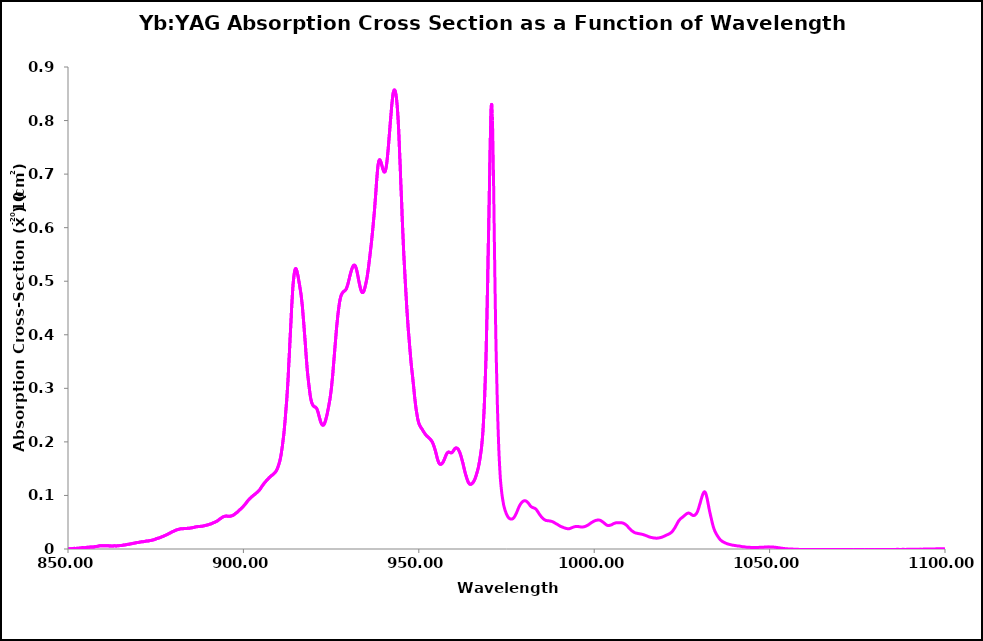
| Category | 250K |
|---|---|
| 850.0 | 0 |
| 850.05 | 0 |
| 850.1 | 0 |
| 850.15 | 0 |
| 850.2 | 0 |
| 850.25 | 0 |
| 850.3 | 0 |
| 850.35 | 0 |
| 850.4 | 0 |
| 850.45 | 0 |
| 850.5 | 0 |
| 850.55 | 0 |
| 850.6 | 0 |
| 850.65 | 0 |
| 850.7 | 0 |
| 850.75 | 0 |
| 850.8 | 0 |
| 850.85 | 0 |
| 850.9 | 0 |
| 850.95 | 0 |
| 851.0 | 0 |
| 851.05 | 0.001 |
| 851.1 | 0.001 |
| 851.15 | 0.001 |
| 851.2 | 0.001 |
| 851.25 | 0.001 |
| 851.3 | 0.001 |
| 851.35 | 0.001 |
| 851.4 | 0.001 |
| 851.45 | 0.001 |
| 851.5 | 0.001 |
| 851.55 | 0.001 |
| 851.6 | 0.001 |
| 851.65 | 0.001 |
| 851.7 | 0.001 |
| 851.75 | 0.001 |
| 851.8 | 0.001 |
| 851.85 | 0.001 |
| 851.9 | 0.001 |
| 851.95 | 0.001 |
| 852.0 | 0.001 |
| 852.05 | 0.001 |
| 852.1 | 0.001 |
| 852.15 | 0.001 |
| 852.2 | 0.001 |
| 852.25 | 0.001 |
| 852.3 | 0.001 |
| 852.35 | 0.001 |
| 852.4 | 0.001 |
| 852.45 | 0.001 |
| 852.5 | 0.001 |
| 852.55 | 0.001 |
| 852.6 | 0.001 |
| 852.65 | 0.002 |
| 852.7 | 0.001 |
| 852.75 | 0.001 |
| 852.8 | 0.001 |
| 852.85 | 0.001 |
| 852.9 | 0.001 |
| 852.95 | 0.002 |
| 853.0 | 0.001 |
| 853.05 | 0.001 |
| 853.1 | 0.001 |
| 853.15 | 0.002 |
| 853.2 | 0.001 |
| 853.25 | 0.002 |
| 853.3 | 0.002 |
| 853.35 | 0.002 |
| 853.4 | 0.002 |
| 853.45 | 0.002 |
| 853.5 | 0.002 |
| 853.55 | 0.002 |
| 853.6 | 0.002 |
| 853.65 | 0.002 |
| 853.7 | 0.002 |
| 853.75 | 0.002 |
| 853.8 | 0.002 |
| 853.85 | 0.002 |
| 853.9 | 0.002 |
| 853.95 | 0.002 |
| 854.0 | 0.002 |
| 854.05 | 0.002 |
| 854.1 | 0.003 |
| 854.15 | 0.003 |
| 854.2 | 0.003 |
| 854.25 | 0.003 |
| 854.3 | 0.003 |
| 854.35 | 0.003 |
| 854.4 | 0.002 |
| 854.45 | 0.002 |
| 854.5 | 0.002 |
| 854.55 | 0.002 |
| 854.6 | 0.002 |
| 854.65 | 0.002 |
| 854.7 | 0.002 |
| 854.75 | 0.002 |
| 854.8 | 0.002 |
| 854.85 | 0.002 |
| 854.9 | 0.003 |
| 854.95 | 0.003 |
| 855.0 | 0.003 |
| 855.05 | 0.003 |
| 855.1 | 0.003 |
| 855.15 | 0.003 |
| 855.2 | 0.003 |
| 855.25 | 0.003 |
| 855.3 | 0.003 |
| 855.35 | 0.003 |
| 855.4 | 0.003 |
| 855.45 | 0.003 |
| 855.5 | 0.003 |
| 855.55 | 0.003 |
| 855.6 | 0.003 |
| 855.65 | 0.003 |
| 855.7 | 0.003 |
| 855.75 | 0.003 |
| 855.8 | 0.003 |
| 855.85 | 0.003 |
| 855.9 | 0.003 |
| 855.95 | 0.003 |
| 856.0 | 0.003 |
| 856.05 | 0.003 |
| 856.1 | 0.003 |
| 856.15 | 0.003 |
| 856.2 | 0.004 |
| 856.25 | 0.003 |
| 856.3 | 0.004 |
| 856.35 | 0.004 |
| 856.4 | 0.004 |
| 856.45 | 0.004 |
| 856.5 | 0.004 |
| 856.55 | 0.004 |
| 856.6 | 0.004 |
| 856.65 | 0.004 |
| 856.7 | 0.004 |
| 856.75 | 0.004 |
| 856.8 | 0.004 |
| 856.85 | 0.004 |
| 856.9 | 0.004 |
| 856.95 | 0.004 |
| 857.0 | 0.004 |
| 857.05 | 0.004 |
| 857.1 | 0.004 |
| 857.15 | 0.004 |
| 857.2 | 0.004 |
| 857.25 | 0.004 |
| 857.3 | 0.004 |
| 857.35 | 0.004 |
| 857.4 | 0.004 |
| 857.45 | 0.004 |
| 857.5 | 0.004 |
| 857.55 | 0.004 |
| 857.6 | 0.004 |
| 857.65 | 0.004 |
| 857.7 | 0.004 |
| 857.75 | 0.004 |
| 857.8 | 0.005 |
| 857.85 | 0.005 |
| 857.9 | 0.005 |
| 857.95 | 0.005 |
| 858.0 | 0.005 |
| 858.05 | 0.005 |
| 858.1 | 0.005 |
| 858.15 | 0.005 |
| 858.2 | 0.005 |
| 858.25 | 0.005 |
| 858.3 | 0.005 |
| 858.35 | 0.005 |
| 858.4 | 0.005 |
| 858.45 | 0.005 |
| 858.5 | 0.005 |
| 858.55 | 0.005 |
| 858.6 | 0.005 |
| 858.65 | 0.005 |
| 858.7 | 0.005 |
| 858.75 | 0.006 |
| 858.8 | 0.006 |
| 858.85 | 0.006 |
| 858.9 | 0.006 |
| 858.95 | 0.006 |
| 859.0 | 0.006 |
| 859.05 | 0.006 |
| 859.1 | 0.006 |
| 859.15 | 0.006 |
| 859.2 | 0.006 |
| 859.25 | 0.006 |
| 859.3 | 0.006 |
| 859.35 | 0.006 |
| 859.4 | 0.006 |
| 859.45 | 0.006 |
| 859.5 | 0.006 |
| 859.55 | 0.006 |
| 859.6 | 0.006 |
| 859.65 | 0.006 |
| 859.7 | 0.006 |
| 859.75 | 0.006 |
| 859.8 | 0.006 |
| 859.85 | 0.006 |
| 859.9 | 0.006 |
| 859.95 | 0.006 |
| 860.0 | 0.006 |
| 860.05 | 0.006 |
| 860.1 | 0.006 |
| 860.15 | 0.006 |
| 860.2 | 0.006 |
| 860.25 | 0.006 |
| 860.3 | 0.006 |
| 860.35 | 0.006 |
| 860.4 | 0.006 |
| 860.45 | 0.006 |
| 860.5 | 0.006 |
| 860.55 | 0.006 |
| 860.6 | 0.006 |
| 860.65 | 0.006 |
| 860.7 | 0.006 |
| 860.75 | 0.006 |
| 860.8 | 0.006 |
| 860.85 | 0.006 |
| 860.9 | 0.006 |
| 860.95 | 0.006 |
| 861.0 | 0.006 |
| 861.05 | 0.006 |
| 861.1 | 0.006 |
| 861.15 | 0.006 |
| 861.2 | 0.006 |
| 861.25 | 0.006 |
| 861.3 | 0.006 |
| 861.35 | 0.006 |
| 861.4 | 0.006 |
| 861.45 | 0.006 |
| 861.5 | 0.006 |
| 861.55 | 0.006 |
| 861.6 | 0.006 |
| 861.65 | 0.006 |
| 861.7 | 0.006 |
| 861.75 | 0.006 |
| 861.8 | 0.006 |
| 861.85 | 0.006 |
| 861.9 | 0.006 |
| 861.95 | 0.006 |
| 862.0 | 0.006 |
| 862.05 | 0.006 |
| 862.1 | 0.006 |
| 862.15 | 0.006 |
| 862.2 | 0.006 |
| 862.25 | 0.006 |
| 862.3 | 0.006 |
| 862.35 | 0.006 |
| 862.4 | 0.006 |
| 862.45 | 0.006 |
| 862.5 | 0.006 |
| 862.55 | 0.006 |
| 862.6 | 0.006 |
| 862.65 | 0.006 |
| 862.7 | 0.006 |
| 862.75 | 0.006 |
| 862.8 | 0.006 |
| 862.85 | 0.006 |
| 862.9 | 0.006 |
| 862.95 | 0.006 |
| 863.0 | 0.006 |
| 863.05 | 0.006 |
| 863.1 | 0.006 |
| 863.15 | 0.006 |
| 863.2 | 0.006 |
| 863.25 | 0.006 |
| 863.3 | 0.006 |
| 863.35 | 0.006 |
| 863.4 | 0.006 |
| 863.45 | 0.006 |
| 863.5 | 0.006 |
| 863.55 | 0.006 |
| 863.6 | 0.006 |
| 863.65 | 0.006 |
| 863.7 | 0.006 |
| 863.75 | 0.006 |
| 863.8 | 0.006 |
| 863.85 | 0.006 |
| 863.9 | 0.006 |
| 863.95 | 0.006 |
| 864.0 | 0.006 |
| 864.05 | 0.006 |
| 864.1 | 0.006 |
| 864.15 | 0.006 |
| 864.2 | 0.006 |
| 864.25 | 0.006 |
| 864.3 | 0.006 |
| 864.35 | 0.006 |
| 864.4 | 0.006 |
| 864.45 | 0.006 |
| 864.5 | 0.006 |
| 864.55 | 0.006 |
| 864.6 | 0.006 |
| 864.65 | 0.006 |
| 864.7 | 0.006 |
| 864.75 | 0.006 |
| 864.8 | 0.006 |
| 864.85 | 0.007 |
| 864.9 | 0.007 |
| 864.95 | 0.007 |
| 865.0 | 0.007 |
| 865.05 | 0.007 |
| 865.1 | 0.007 |
| 865.15 | 0.007 |
| 865.2 | 0.007 |
| 865.25 | 0.007 |
| 865.3 | 0.007 |
| 865.35 | 0.007 |
| 865.4 | 0.007 |
| 865.45 | 0.007 |
| 865.5 | 0.007 |
| 865.55 | 0.007 |
| 865.6 | 0.007 |
| 865.65 | 0.007 |
| 865.7 | 0.007 |
| 865.75 | 0.007 |
| 865.8 | 0.007 |
| 865.85 | 0.007 |
| 865.9 | 0.007 |
| 865.95 | 0.007 |
| 866.0 | 0.007 |
| 866.05 | 0.007 |
| 866.1 | 0.008 |
| 866.15 | 0.008 |
| 866.2 | 0.008 |
| 866.25 | 0.008 |
| 866.3 | 0.008 |
| 866.35 | 0.008 |
| 866.4 | 0.008 |
| 866.45 | 0.008 |
| 866.5 | 0.008 |
| 866.55 | 0.008 |
| 866.6 | 0.008 |
| 866.65 | 0.008 |
| 866.7 | 0.008 |
| 866.75 | 0.008 |
| 866.8 | 0.008 |
| 866.85 | 0.008 |
| 866.9 | 0.009 |
| 866.95 | 0.009 |
| 867.0 | 0.009 |
| 867.05 | 0.009 |
| 867.1 | 0.009 |
| 867.15 | 0.009 |
| 867.2 | 0.009 |
| 867.25 | 0.009 |
| 867.3 | 0.009 |
| 867.35 | 0.009 |
| 867.4 | 0.009 |
| 867.45 | 0.009 |
| 867.5 | 0.009 |
| 867.55 | 0.009 |
| 867.6 | 0.009 |
| 867.65 | 0.009 |
| 867.7 | 0.009 |
| 867.75 | 0.009 |
| 867.8 | 0.009 |
| 867.85 | 0.01 |
| 867.9 | 0.01 |
| 867.95 | 0.01 |
| 868.0 | 0.01 |
| 868.05 | 0.01 |
| 868.1 | 0.01 |
| 868.15 | 0.01 |
| 868.2 | 0.01 |
| 868.25 | 0.01 |
| 868.3 | 0.01 |
| 868.35 | 0.01 |
| 868.4 | 0.01 |
| 868.45 | 0.01 |
| 868.5 | 0.01 |
| 868.55 | 0.011 |
| 868.6 | 0.011 |
| 868.65 | 0.011 |
| 868.7 | 0.011 |
| 868.75 | 0.011 |
| 868.8 | 0.011 |
| 868.85 | 0.011 |
| 868.9 | 0.011 |
| 868.95 | 0.011 |
| 869.0 | 0.011 |
| 869.05 | 0.011 |
| 869.1 | 0.011 |
| 869.15 | 0.011 |
| 869.2 | 0.011 |
| 869.25 | 0.011 |
| 869.3 | 0.012 |
| 869.35 | 0.012 |
| 869.4 | 0.012 |
| 869.45 | 0.012 |
| 869.5 | 0.012 |
| 869.55 | 0.012 |
| 869.6 | 0.012 |
| 869.65 | 0.012 |
| 869.7 | 0.012 |
| 869.75 | 0.012 |
| 869.8 | 0.012 |
| 869.85 | 0.012 |
| 869.9 | 0.012 |
| 869.95 | 0.012 |
| 870.0 | 0.012 |
| 870.05 | 0.012 |
| 870.1 | 0.012 |
| 870.15 | 0.012 |
| 870.2 | 0.012 |
| 870.25 | 0.013 |
| 870.3 | 0.013 |
| 870.35 | 0.013 |
| 870.4 | 0.013 |
| 870.45 | 0.013 |
| 870.5 | 0.013 |
| 870.55 | 0.013 |
| 870.6 | 0.013 |
| 870.65 | 0.013 |
| 870.7 | 0.013 |
| 870.75 | 0.013 |
| 870.8 | 0.013 |
| 870.85 | 0.013 |
| 870.9 | 0.013 |
| 870.95 | 0.013 |
| 871.0 | 0.013 |
| 871.05 | 0.014 |
| 871.1 | 0.014 |
| 871.15 | 0.014 |
| 871.2 | 0.014 |
| 871.25 | 0.014 |
| 871.3 | 0.014 |
| 871.35 | 0.014 |
| 871.4 | 0.014 |
| 871.45 | 0.014 |
| 871.5 | 0.014 |
| 871.55 | 0.014 |
| 871.6 | 0.014 |
| 871.65 | 0.014 |
| 871.7 | 0.014 |
| 871.75 | 0.014 |
| 871.8 | 0.014 |
| 871.85 | 0.014 |
| 871.9 | 0.014 |
| 871.95 | 0.014 |
| 872.0 | 0.014 |
| 872.05 | 0.014 |
| 872.1 | 0.014 |
| 872.15 | 0.015 |
| 872.2 | 0.015 |
| 872.25 | 0.015 |
| 872.3 | 0.015 |
| 872.35 | 0.015 |
| 872.4 | 0.015 |
| 872.45 | 0.015 |
| 872.5 | 0.015 |
| 872.55 | 0.015 |
| 872.6 | 0.015 |
| 872.65 | 0.015 |
| 872.7 | 0.015 |
| 872.75 | 0.015 |
| 872.8 | 0.015 |
| 872.85 | 0.015 |
| 872.9 | 0.015 |
| 872.95 | 0.015 |
| 873.0 | 0.015 |
| 873.05 | 0.015 |
| 873.1 | 0.015 |
| 873.15 | 0.015 |
| 873.2 | 0.015 |
| 873.25 | 0.016 |
| 873.3 | 0.016 |
| 873.35 | 0.016 |
| 873.4 | 0.016 |
| 873.45 | 0.016 |
| 873.5 | 0.016 |
| 873.55 | 0.016 |
| 873.6 | 0.016 |
| 873.65 | 0.016 |
| 873.7 | 0.016 |
| 873.75 | 0.016 |
| 873.8 | 0.016 |
| 873.85 | 0.016 |
| 873.9 | 0.016 |
| 873.95 | 0.016 |
| 874.0 | 0.017 |
| 874.05 | 0.017 |
| 874.1 | 0.017 |
| 874.15 | 0.017 |
| 874.2 | 0.017 |
| 874.25 | 0.017 |
| 874.3 | 0.017 |
| 874.35 | 0.017 |
| 874.4 | 0.017 |
| 874.45 | 0.017 |
| 874.5 | 0.017 |
| 874.55 | 0.017 |
| 874.6 | 0.018 |
| 874.65 | 0.018 |
| 874.7 | 0.018 |
| 874.75 | 0.018 |
| 874.8 | 0.018 |
| 874.85 | 0.018 |
| 874.9 | 0.018 |
| 874.95 | 0.018 |
| 875.0 | 0.019 |
| 875.05 | 0.019 |
| 875.1 | 0.019 |
| 875.15 | 0.019 |
| 875.2 | 0.019 |
| 875.25 | 0.019 |
| 875.3 | 0.019 |
| 875.35 | 0.019 |
| 875.4 | 0.02 |
| 875.45 | 0.02 |
| 875.5 | 0.02 |
| 875.55 | 0.02 |
| 875.6 | 0.02 |
| 875.65 | 0.02 |
| 875.7 | 0.02 |
| 875.75 | 0.02 |
| 875.8 | 0.02 |
| 875.85 | 0.02 |
| 875.9 | 0.021 |
| 875.95 | 0.021 |
| 876.0 | 0.021 |
| 876.05 | 0.021 |
| 876.1 | 0.021 |
| 876.15 | 0.021 |
| 876.2 | 0.021 |
| 876.25 | 0.021 |
| 876.3 | 0.021 |
| 876.35 | 0.022 |
| 876.4 | 0.022 |
| 876.45 | 0.022 |
| 876.5 | 0.022 |
| 876.55 | 0.022 |
| 876.6 | 0.022 |
| 876.65 | 0.023 |
| 876.7 | 0.023 |
| 876.75 | 0.023 |
| 876.8 | 0.023 |
| 876.85 | 0.023 |
| 876.9 | 0.023 |
| 876.95 | 0.023 |
| 877.0 | 0.023 |
| 877.05 | 0.023 |
| 877.1 | 0.023 |
| 877.15 | 0.024 |
| 877.2 | 0.024 |
| 877.25 | 0.024 |
| 877.3 | 0.024 |
| 877.35 | 0.024 |
| 877.4 | 0.024 |
| 877.45 | 0.025 |
| 877.5 | 0.025 |
| 877.55 | 0.025 |
| 877.6 | 0.025 |
| 877.65 | 0.025 |
| 877.7 | 0.025 |
| 877.75 | 0.026 |
| 877.8 | 0.026 |
| 877.85 | 0.026 |
| 877.9 | 0.026 |
| 877.95 | 0.026 |
| 878.0 | 0.026 |
| 878.05 | 0.026 |
| 878.1 | 0.027 |
| 878.15 | 0.027 |
| 878.2 | 0.027 |
| 878.25 | 0.027 |
| 878.3 | 0.027 |
| 878.35 | 0.027 |
| 878.4 | 0.028 |
| 878.45 | 0.028 |
| 878.5 | 0.028 |
| 878.55 | 0.028 |
| 878.6 | 0.028 |
| 878.65 | 0.028 |
| 878.7 | 0.029 |
| 878.75 | 0.029 |
| 878.8 | 0.029 |
| 878.85 | 0.029 |
| 878.9 | 0.029 |
| 878.95 | 0.029 |
| 879.0 | 0.03 |
| 879.05 | 0.03 |
| 879.1 | 0.03 |
| 879.15 | 0.03 |
| 879.2 | 0.03 |
| 879.25 | 0.03 |
| 879.3 | 0.031 |
| 879.35 | 0.031 |
| 879.4 | 0.031 |
| 879.45 | 0.031 |
| 879.5 | 0.031 |
| 879.55 | 0.032 |
| 879.6 | 0.032 |
| 879.65 | 0.032 |
| 879.7 | 0.032 |
| 879.75 | 0.032 |
| 879.8 | 0.032 |
| 879.85 | 0.033 |
| 879.9 | 0.033 |
| 879.95 | 0.033 |
| 880.0 | 0.033 |
| 880.05 | 0.033 |
| 880.1 | 0.033 |
| 880.15 | 0.033 |
| 880.2 | 0.033 |
| 880.25 | 0.034 |
| 880.3 | 0.034 |
| 880.35 | 0.034 |
| 880.4 | 0.034 |
| 880.45 | 0.034 |
| 880.5 | 0.034 |
| 880.55 | 0.035 |
| 880.6 | 0.035 |
| 880.65 | 0.035 |
| 880.7 | 0.035 |
| 880.75 | 0.035 |
| 880.8 | 0.035 |
| 880.85 | 0.035 |
| 880.9 | 0.036 |
| 880.95 | 0.036 |
| 881.0 | 0.036 |
| 881.05 | 0.036 |
| 881.1 | 0.036 |
| 881.15 | 0.036 |
| 881.2 | 0.036 |
| 881.25 | 0.036 |
| 881.3 | 0.036 |
| 881.35 | 0.036 |
| 881.4 | 0.037 |
| 881.45 | 0.037 |
| 881.5 | 0.037 |
| 881.55 | 0.037 |
| 881.6 | 0.037 |
| 881.65 | 0.037 |
| 881.7 | 0.037 |
| 881.75 | 0.037 |
| 881.8 | 0.037 |
| 881.85 | 0.037 |
| 881.9 | 0.037 |
| 881.95 | 0.037 |
| 882.0 | 0.038 |
| 882.05 | 0.038 |
| 882.1 | 0.038 |
| 882.15 | 0.038 |
| 882.2 | 0.038 |
| 882.25 | 0.038 |
| 882.3 | 0.038 |
| 882.35 | 0.038 |
| 882.4 | 0.038 |
| 882.45 | 0.038 |
| 882.5 | 0.038 |
| 882.55 | 0.038 |
| 882.6 | 0.038 |
| 882.65 | 0.038 |
| 882.7 | 0.038 |
| 882.75 | 0.038 |
| 882.8 | 0.038 |
| 882.85 | 0.038 |
| 882.9 | 0.038 |
| 882.95 | 0.038 |
| 883.0 | 0.038 |
| 883.05 | 0.038 |
| 883.1 | 0.038 |
| 883.15 | 0.038 |
| 883.2 | 0.038 |
| 883.25 | 0.038 |
| 883.3 | 0.038 |
| 883.35 | 0.038 |
| 883.4 | 0.038 |
| 883.45 | 0.038 |
| 883.5 | 0.038 |
| 883.55 | 0.038 |
| 883.6 | 0.038 |
| 883.65 | 0.038 |
| 883.7 | 0.038 |
| 883.75 | 0.038 |
| 883.8 | 0.038 |
| 883.85 | 0.038 |
| 883.9 | 0.039 |
| 883.95 | 0.039 |
| 884.0 | 0.039 |
| 884.05 | 0.039 |
| 884.1 | 0.039 |
| 884.15 | 0.039 |
| 884.2 | 0.039 |
| 884.25 | 0.039 |
| 884.3 | 0.039 |
| 884.35 | 0.039 |
| 884.4 | 0.039 |
| 884.45 | 0.039 |
| 884.5 | 0.039 |
| 884.55 | 0.039 |
| 884.6 | 0.039 |
| 884.65 | 0.039 |
| 884.7 | 0.039 |
| 884.75 | 0.039 |
| 884.8 | 0.039 |
| 884.85 | 0.039 |
| 884.9 | 0.039 |
| 884.95 | 0.039 |
| 885.0 | 0.039 |
| 885.05 | 0.039 |
| 885.1 | 0.039 |
| 885.15 | 0.039 |
| 885.2 | 0.039 |
| 885.25 | 0.039 |
| 885.3 | 0.04 |
| 885.35 | 0.04 |
| 885.4 | 0.04 |
| 885.45 | 0.04 |
| 885.5 | 0.04 |
| 885.55 | 0.04 |
| 885.6 | 0.04 |
| 885.65 | 0.04 |
| 885.7 | 0.04 |
| 885.75 | 0.04 |
| 885.8 | 0.04 |
| 885.85 | 0.04 |
| 885.9 | 0.04 |
| 885.95 | 0.041 |
| 886.0 | 0.041 |
| 886.05 | 0.041 |
| 886.1 | 0.041 |
| 886.15 | 0.041 |
| 886.2 | 0.041 |
| 886.25 | 0.041 |
| 886.3 | 0.041 |
| 886.35 | 0.041 |
| 886.4 | 0.041 |
| 886.45 | 0.041 |
| 886.5 | 0.041 |
| 886.55 | 0.041 |
| 886.6 | 0.041 |
| 886.65 | 0.042 |
| 886.7 | 0.042 |
| 886.75 | 0.042 |
| 886.8 | 0.042 |
| 886.85 | 0.042 |
| 886.9 | 0.042 |
| 886.95 | 0.042 |
| 887.0 | 0.042 |
| 887.05 | 0.042 |
| 887.1 | 0.042 |
| 887.15 | 0.042 |
| 887.2 | 0.042 |
| 887.25 | 0.042 |
| 887.3 | 0.042 |
| 887.35 | 0.042 |
| 887.4 | 0.042 |
| 887.45 | 0.042 |
| 887.5 | 0.042 |
| 887.55 | 0.042 |
| 887.6 | 0.042 |
| 887.65 | 0.042 |
| 887.7 | 0.042 |
| 887.75 | 0.042 |
| 887.8 | 0.042 |
| 887.85 | 0.042 |
| 887.9 | 0.042 |
| 887.95 | 0.042 |
| 888.0 | 0.042 |
| 888.05 | 0.042 |
| 888.1 | 0.042 |
| 888.15 | 0.043 |
| 888.2 | 0.043 |
| 888.25 | 0.043 |
| 888.3 | 0.043 |
| 888.35 | 0.043 |
| 888.4 | 0.043 |
| 888.45 | 0.043 |
| 888.5 | 0.043 |
| 888.55 | 0.043 |
| 888.6 | 0.043 |
| 888.65 | 0.043 |
| 888.7 | 0.043 |
| 888.75 | 0.043 |
| 888.8 | 0.043 |
| 888.85 | 0.043 |
| 888.9 | 0.043 |
| 888.95 | 0.044 |
| 889.0 | 0.044 |
| 889.05 | 0.044 |
| 889.1 | 0.044 |
| 889.15 | 0.044 |
| 889.2 | 0.044 |
| 889.25 | 0.044 |
| 889.3 | 0.044 |
| 889.35 | 0.044 |
| 889.4 | 0.044 |
| 889.45 | 0.044 |
| 889.5 | 0.045 |
| 889.55 | 0.045 |
| 889.6 | 0.045 |
| 889.65 | 0.045 |
| 889.7 | 0.045 |
| 889.75 | 0.045 |
| 889.8 | 0.045 |
| 889.85 | 0.045 |
| 889.9 | 0.045 |
| 889.95 | 0.045 |
| 890.0 | 0.045 |
| 890.05 | 0.045 |
| 890.1 | 0.046 |
| 890.15 | 0.046 |
| 890.2 | 0.046 |
| 890.25 | 0.046 |
| 890.3 | 0.046 |
| 890.35 | 0.046 |
| 890.4 | 0.046 |
| 890.45 | 0.046 |
| 890.5 | 0.047 |
| 890.55 | 0.047 |
| 890.6 | 0.047 |
| 890.65 | 0.047 |
| 890.7 | 0.047 |
| 890.75 | 0.047 |
| 890.8 | 0.047 |
| 890.85 | 0.047 |
| 890.9 | 0.047 |
| 890.95 | 0.047 |
| 891.0 | 0.048 |
| 891.05 | 0.048 |
| 891.1 | 0.048 |
| 891.15 | 0.048 |
| 891.2 | 0.048 |
| 891.25 | 0.048 |
| 891.3 | 0.049 |
| 891.35 | 0.049 |
| 891.4 | 0.049 |
| 891.45 | 0.049 |
| 891.5 | 0.049 |
| 891.55 | 0.049 |
| 891.6 | 0.049 |
| 891.65 | 0.049 |
| 891.7 | 0.05 |
| 891.75 | 0.05 |
| 891.8 | 0.05 |
| 891.85 | 0.05 |
| 891.9 | 0.05 |
| 891.95 | 0.05 |
| 892.0 | 0.05 |
| 892.05 | 0.051 |
| 892.1 | 0.051 |
| 892.15 | 0.051 |
| 892.2 | 0.051 |
| 892.25 | 0.051 |
| 892.3 | 0.052 |
| 892.35 | 0.052 |
| 892.4 | 0.052 |
| 892.45 | 0.052 |
| 892.5 | 0.052 |
| 892.55 | 0.052 |
| 892.6 | 0.053 |
| 892.65 | 0.053 |
| 892.7 | 0.053 |
| 892.75 | 0.053 |
| 892.8 | 0.053 |
| 892.85 | 0.054 |
| 892.9 | 0.054 |
| 892.95 | 0.054 |
| 893.0 | 0.054 |
| 893.05 | 0.055 |
| 893.1 | 0.055 |
| 893.15 | 0.055 |
| 893.2 | 0.056 |
| 893.25 | 0.056 |
| 893.3 | 0.056 |
| 893.35 | 0.056 |
| 893.4 | 0.057 |
| 893.45 | 0.057 |
| 893.5 | 0.057 |
| 893.55 | 0.057 |
| 893.6 | 0.057 |
| 893.65 | 0.058 |
| 893.7 | 0.058 |
| 893.75 | 0.058 |
| 893.8 | 0.058 |
| 893.85 | 0.059 |
| 893.9 | 0.059 |
| 893.95 | 0.059 |
| 894.0 | 0.059 |
| 894.05 | 0.059 |
| 894.1 | 0.06 |
| 894.15 | 0.06 |
| 894.2 | 0.06 |
| 894.25 | 0.06 |
| 894.3 | 0.06 |
| 894.35 | 0.06 |
| 894.4 | 0.06 |
| 894.45 | 0.061 |
| 894.5 | 0.061 |
| 894.55 | 0.061 |
| 894.6 | 0.061 |
| 894.65 | 0.061 |
| 894.7 | 0.061 |
| 894.75 | 0.061 |
| 894.8 | 0.061 |
| 894.85 | 0.061 |
| 894.9 | 0.061 |
| 894.95 | 0.061 |
| 895.0 | 0.061 |
| 895.05 | 0.061 |
| 895.1 | 0.061 |
| 895.15 | 0.061 |
| 895.2 | 0.061 |
| 895.25 | 0.061 |
| 895.3 | 0.061 |
| 895.35 | 0.061 |
| 895.4 | 0.061 |
| 895.45 | 0.061 |
| 895.5 | 0.061 |
| 895.55 | 0.061 |
| 895.6 | 0.061 |
| 895.65 | 0.061 |
| 895.7 | 0.061 |
| 895.75 | 0.061 |
| 895.8 | 0.061 |
| 895.85 | 0.061 |
| 895.9 | 0.061 |
| 895.95 | 0.061 |
| 896.0 | 0.061 |
| 896.05 | 0.061 |
| 896.1 | 0.061 |
| 896.15 | 0.061 |
| 896.2 | 0.061 |
| 896.25 | 0.061 |
| 896.3 | 0.061 |
| 896.35 | 0.061 |
| 896.4 | 0.062 |
| 896.45 | 0.062 |
| 896.5 | 0.062 |
| 896.55 | 0.062 |
| 896.6 | 0.062 |
| 896.65 | 0.062 |
| 896.7 | 0.062 |
| 896.75 | 0.062 |
| 896.8 | 0.062 |
| 896.85 | 0.062 |
| 896.9 | 0.063 |
| 896.95 | 0.063 |
| 897.0 | 0.063 |
| 897.05 | 0.063 |
| 897.1 | 0.063 |
| 897.15 | 0.063 |
| 897.2 | 0.064 |
| 897.25 | 0.064 |
| 897.3 | 0.064 |
| 897.35 | 0.064 |
| 897.4 | 0.064 |
| 897.45 | 0.065 |
| 897.5 | 0.065 |
| 897.55 | 0.065 |
| 897.6 | 0.065 |
| 897.65 | 0.066 |
| 897.7 | 0.066 |
| 897.75 | 0.066 |
| 897.8 | 0.066 |
| 897.85 | 0.067 |
| 897.9 | 0.067 |
| 897.95 | 0.067 |
| 898.0 | 0.068 |
| 898.05 | 0.068 |
| 898.1 | 0.068 |
| 898.15 | 0.068 |
| 898.2 | 0.068 |
| 898.25 | 0.069 |
| 898.3 | 0.069 |
| 898.35 | 0.069 |
| 898.4 | 0.07 |
| 898.45 | 0.07 |
| 898.5 | 0.07 |
| 898.55 | 0.07 |
| 898.6 | 0.071 |
| 898.65 | 0.071 |
| 898.7 | 0.071 |
| 898.75 | 0.072 |
| 898.8 | 0.072 |
| 898.85 | 0.072 |
| 898.9 | 0.073 |
| 898.95 | 0.073 |
| 899.0 | 0.073 |
| 899.05 | 0.074 |
| 899.1 | 0.074 |
| 899.15 | 0.074 |
| 899.2 | 0.075 |
| 899.25 | 0.075 |
| 899.3 | 0.075 |
| 899.35 | 0.076 |
| 899.4 | 0.076 |
| 899.45 | 0.076 |
| 899.5 | 0.076 |
| 899.55 | 0.077 |
| 899.6 | 0.077 |
| 899.65 | 0.077 |
| 899.7 | 0.078 |
| 899.75 | 0.078 |
| 899.8 | 0.078 |
| 899.85 | 0.079 |
| 899.9 | 0.079 |
| 899.95 | 0.079 |
| 900.0 | 0.08 |
| 900.05 | 0.08 |
| 900.1 | 0.08 |
| 900.15 | 0.081 |
| 900.2 | 0.081 |
| 900.25 | 0.082 |
| 900.3 | 0.082 |
| 900.35 | 0.082 |
| 900.4 | 0.083 |
| 900.45 | 0.083 |
| 900.5 | 0.084 |
| 900.55 | 0.084 |
| 900.6 | 0.084 |
| 900.65 | 0.085 |
| 900.7 | 0.085 |
| 900.75 | 0.086 |
| 900.8 | 0.086 |
| 900.85 | 0.087 |
| 900.9 | 0.087 |
| 900.95 | 0.087 |
| 901.0 | 0.088 |
| 901.05 | 0.088 |
| 901.1 | 0.089 |
| 901.15 | 0.089 |
| 901.2 | 0.09 |
| 901.25 | 0.09 |
| 901.3 | 0.09 |
| 901.35 | 0.091 |
| 901.4 | 0.091 |
| 901.45 | 0.092 |
| 901.5 | 0.092 |
| 901.55 | 0.092 |
| 901.6 | 0.093 |
| 901.65 | 0.093 |
| 901.7 | 0.093 |
| 901.75 | 0.094 |
| 901.8 | 0.094 |
| 901.85 | 0.094 |
| 901.9 | 0.095 |
| 901.95 | 0.095 |
| 902.0 | 0.095 |
| 902.05 | 0.096 |
| 902.1 | 0.096 |
| 902.15 | 0.096 |
| 902.2 | 0.096 |
| 902.25 | 0.097 |
| 902.3 | 0.097 |
| 902.35 | 0.097 |
| 902.4 | 0.098 |
| 902.45 | 0.098 |
| 902.5 | 0.098 |
| 902.55 | 0.098 |
| 902.6 | 0.099 |
| 902.65 | 0.099 |
| 902.7 | 0.099 |
| 902.75 | 0.1 |
| 902.8 | 0.1 |
| 902.85 | 0.1 |
| 902.9 | 0.1 |
| 902.95 | 0.101 |
| 903.0 | 0.101 |
| 903.05 | 0.101 |
| 903.1 | 0.101 |
| 903.15 | 0.102 |
| 903.2 | 0.102 |
| 903.25 | 0.102 |
| 903.3 | 0.102 |
| 903.35 | 0.103 |
| 903.4 | 0.103 |
| 903.45 | 0.103 |
| 903.5 | 0.103 |
| 903.55 | 0.104 |
| 903.6 | 0.104 |
| 903.65 | 0.104 |
| 903.7 | 0.105 |
| 903.75 | 0.105 |
| 903.8 | 0.105 |
| 903.85 | 0.105 |
| 903.9 | 0.106 |
| 903.95 | 0.106 |
| 904.0 | 0.106 |
| 904.05 | 0.107 |
| 904.1 | 0.107 |
| 904.15 | 0.107 |
| 904.2 | 0.107 |
| 904.25 | 0.108 |
| 904.3 | 0.108 |
| 904.35 | 0.109 |
| 904.4 | 0.109 |
| 904.45 | 0.109 |
| 904.5 | 0.11 |
| 904.55 | 0.11 |
| 904.6 | 0.11 |
| 904.65 | 0.111 |
| 904.7 | 0.111 |
| 904.75 | 0.112 |
| 904.8 | 0.112 |
| 904.85 | 0.113 |
| 904.9 | 0.113 |
| 904.95 | 0.114 |
| 905.0 | 0.114 |
| 905.05 | 0.115 |
| 905.1 | 0.115 |
| 905.15 | 0.116 |
| 905.2 | 0.116 |
| 905.25 | 0.117 |
| 905.3 | 0.117 |
| 905.35 | 0.118 |
| 905.4 | 0.118 |
| 905.45 | 0.118 |
| 905.5 | 0.119 |
| 905.55 | 0.119 |
| 905.6 | 0.12 |
| 905.65 | 0.12 |
| 905.7 | 0.121 |
| 905.75 | 0.121 |
| 905.8 | 0.122 |
| 905.85 | 0.122 |
| 905.9 | 0.122 |
| 905.95 | 0.123 |
| 906.0 | 0.123 |
| 906.05 | 0.124 |
| 906.1 | 0.124 |
| 906.15 | 0.125 |
| 906.2 | 0.125 |
| 906.25 | 0.125 |
| 906.3 | 0.126 |
| 906.35 | 0.126 |
| 906.4 | 0.126 |
| 906.45 | 0.127 |
| 906.5 | 0.127 |
| 906.55 | 0.128 |
| 906.6 | 0.128 |
| 906.65 | 0.128 |
| 906.7 | 0.128 |
| 906.75 | 0.129 |
| 906.8 | 0.129 |
| 906.85 | 0.13 |
| 906.9 | 0.13 |
| 906.95 | 0.13 |
| 907.0 | 0.131 |
| 907.05 | 0.131 |
| 907.1 | 0.131 |
| 907.15 | 0.132 |
| 907.2 | 0.132 |
| 907.25 | 0.132 |
| 907.3 | 0.133 |
| 907.35 | 0.133 |
| 907.4 | 0.133 |
| 907.45 | 0.134 |
| 907.5 | 0.134 |
| 907.55 | 0.134 |
| 907.6 | 0.135 |
| 907.65 | 0.135 |
| 907.7 | 0.135 |
| 907.75 | 0.136 |
| 907.8 | 0.136 |
| 907.85 | 0.136 |
| 907.9 | 0.136 |
| 907.95 | 0.137 |
| 908.0 | 0.137 |
| 908.05 | 0.137 |
| 908.1 | 0.137 |
| 908.15 | 0.138 |
| 908.2 | 0.138 |
| 908.25 | 0.138 |
| 908.3 | 0.138 |
| 908.35 | 0.139 |
| 908.4 | 0.139 |
| 908.45 | 0.139 |
| 908.5 | 0.14 |
| 908.55 | 0.14 |
| 908.6 | 0.14 |
| 908.65 | 0.14 |
| 908.7 | 0.141 |
| 908.75 | 0.141 |
| 908.8 | 0.141 |
| 908.85 | 0.142 |
| 908.9 | 0.142 |
| 908.95 | 0.142 |
| 909.0 | 0.143 |
| 909.05 | 0.143 |
| 909.1 | 0.143 |
| 909.15 | 0.144 |
| 909.2 | 0.144 |
| 909.25 | 0.145 |
| 909.3 | 0.145 |
| 909.35 | 0.146 |
| 909.4 | 0.146 |
| 909.45 | 0.147 |
| 909.5 | 0.148 |
| 909.55 | 0.148 |
| 909.6 | 0.149 |
| 909.65 | 0.15 |
| 909.7 | 0.151 |
| 909.75 | 0.151 |
| 909.8 | 0.152 |
| 909.85 | 0.153 |
| 909.9 | 0.154 |
| 909.95 | 0.155 |
| 910.0 | 0.156 |
| 910.05 | 0.157 |
| 910.1 | 0.158 |
| 910.15 | 0.159 |
| 910.2 | 0.16 |
| 910.25 | 0.161 |
| 910.3 | 0.162 |
| 910.35 | 0.164 |
| 910.4 | 0.165 |
| 910.45 | 0.166 |
| 910.5 | 0.168 |
| 910.55 | 0.169 |
| 910.6 | 0.171 |
| 910.65 | 0.173 |
| 910.7 | 0.174 |
| 910.75 | 0.176 |
| 910.8 | 0.179 |
| 910.85 | 0.181 |
| 910.9 | 0.183 |
| 910.95 | 0.185 |
| 911.0 | 0.187 |
| 911.05 | 0.19 |
| 911.1 | 0.192 |
| 911.15 | 0.194 |
| 911.2 | 0.197 |
| 911.25 | 0.2 |
| 911.3 | 0.202 |
| 911.35 | 0.205 |
| 911.4 | 0.208 |
| 911.45 | 0.21 |
| 911.5 | 0.213 |
| 911.55 | 0.216 |
| 911.6 | 0.22 |
| 911.65 | 0.223 |
| 911.7 | 0.227 |
| 911.75 | 0.23 |
| 911.8 | 0.234 |
| 911.85 | 0.238 |
| 911.9 | 0.241 |
| 911.95 | 0.245 |
| 912.0 | 0.25 |
| 912.05 | 0.254 |
| 912.1 | 0.258 |
| 912.15 | 0.262 |
| 912.2 | 0.266 |
| 912.25 | 0.27 |
| 912.3 | 0.274 |
| 912.35 | 0.278 |
| 912.4 | 0.283 |
| 912.45 | 0.288 |
| 912.5 | 0.293 |
| 912.55 | 0.298 |
| 912.6 | 0.303 |
| 912.65 | 0.308 |
| 912.7 | 0.314 |
| 912.75 | 0.32 |
| 912.8 | 0.326 |
| 912.85 | 0.333 |
| 912.9 | 0.34 |
| 912.95 | 0.346 |
| 913.0 | 0.352 |
| 913.05 | 0.359 |
| 913.1 | 0.365 |
| 913.15 | 0.371 |
| 913.2 | 0.378 |
| 913.25 | 0.385 |
| 913.3 | 0.392 |
| 913.35 | 0.399 |
| 913.4 | 0.405 |
| 913.45 | 0.411 |
| 913.5 | 0.417 |
| 913.55 | 0.423 |
| 913.6 | 0.43 |
| 913.65 | 0.437 |
| 913.7 | 0.444 |
| 913.75 | 0.45 |
| 913.8 | 0.456 |
| 913.85 | 0.462 |
| 913.9 | 0.467 |
| 913.95 | 0.473 |
| 914.0 | 0.478 |
| 914.05 | 0.484 |
| 914.1 | 0.489 |
| 914.15 | 0.493 |
| 914.2 | 0.497 |
| 914.25 | 0.5 |
| 914.3 | 0.503 |
| 914.35 | 0.506 |
| 914.4 | 0.509 |
| 914.45 | 0.512 |
| 914.5 | 0.514 |
| 914.55 | 0.516 |
| 914.6 | 0.518 |
| 914.65 | 0.519 |
| 914.7 | 0.521 |
| 914.75 | 0.522 |
| 914.8 | 0.523 |
| 914.85 | 0.523 |
| 914.9 | 0.524 |
| 914.95 | 0.524 |
| 915.0 | 0.523 |
| 915.05 | 0.523 |
| 915.1 | 0.522 |
| 915.15 | 0.521 |
| 915.2 | 0.52 |
| 915.25 | 0.519 |
| 915.3 | 0.518 |
| 915.35 | 0.516 |
| 915.4 | 0.515 |
| 915.45 | 0.513 |
| 915.5 | 0.512 |
| 915.55 | 0.51 |
| 915.6 | 0.509 |
| 915.65 | 0.507 |
| 915.7 | 0.504 |
| 915.75 | 0.503 |
| 915.8 | 0.501 |
| 915.85 | 0.499 |
| 915.9 | 0.497 |
| 915.95 | 0.495 |
| 916.0 | 0.493 |
| 916.05 | 0.491 |
| 916.1 | 0.489 |
| 916.15 | 0.487 |
| 916.2 | 0.485 |
| 916.25 | 0.483 |
| 916.3 | 0.481 |
| 916.35 | 0.479 |
| 916.4 | 0.477 |
| 916.45 | 0.474 |
| 916.5 | 0.471 |
| 916.55 | 0.469 |
| 916.6 | 0.466 |
| 916.65 | 0.463 |
| 916.7 | 0.46 |
| 916.75 | 0.457 |
| 916.8 | 0.454 |
| 916.85 | 0.45 |
| 916.9 | 0.446 |
| 916.95 | 0.442 |
| 917.0 | 0.438 |
| 917.05 | 0.434 |
| 917.1 | 0.43 |
| 917.15 | 0.426 |
| 917.2 | 0.422 |
| 917.25 | 0.418 |
| 917.3 | 0.413 |
| 917.35 | 0.409 |
| 917.4 | 0.404 |
| 917.45 | 0.4 |
| 917.5 | 0.396 |
| 917.55 | 0.392 |
| 917.6 | 0.387 |
| 917.65 | 0.383 |
| 917.7 | 0.379 |
| 917.75 | 0.374 |
| 917.8 | 0.369 |
| 917.85 | 0.364 |
| 917.9 | 0.36 |
| 917.95 | 0.356 |
| 918.0 | 0.351 |
| 918.05 | 0.347 |
| 918.1 | 0.343 |
| 918.15 | 0.339 |
| 918.2 | 0.335 |
| 918.25 | 0.331 |
| 918.3 | 0.328 |
| 918.35 | 0.325 |
| 918.4 | 0.322 |
| 918.45 | 0.319 |
| 918.5 | 0.316 |
| 918.55 | 0.313 |
| 918.6 | 0.31 |
| 918.65 | 0.307 |
| 918.7 | 0.305 |
| 918.75 | 0.302 |
| 918.8 | 0.299 |
| 918.85 | 0.297 |
| 918.9 | 0.294 |
| 918.95 | 0.291 |
| 919.0 | 0.289 |
| 919.05 | 0.287 |
| 919.1 | 0.285 |
| 919.15 | 0.283 |
| 919.2 | 0.281 |
| 919.25 | 0.279 |
| 919.3 | 0.278 |
| 919.35 | 0.277 |
| 919.4 | 0.275 |
| 919.45 | 0.274 |
| 919.5 | 0.273 |
| 919.55 | 0.272 |
| 919.6 | 0.271 |
| 919.65 | 0.271 |
| 919.7 | 0.27 |
| 919.75 | 0.269 |
| 919.8 | 0.269 |
| 919.85 | 0.268 |
| 919.9 | 0.267 |
| 919.95 | 0.267 |
| 920.0 | 0.267 |
| 920.05 | 0.266 |
| 920.1 | 0.266 |
| 920.15 | 0.266 |
| 920.2 | 0.266 |
| 920.25 | 0.266 |
| 920.3 | 0.265 |
| 920.35 | 0.265 |
| 920.4 | 0.265 |
| 920.45 | 0.265 |
| 920.5 | 0.265 |
| 920.55 | 0.265 |
| 920.6 | 0.264 |
| 920.65 | 0.264 |
| 920.7 | 0.264 |
| 920.75 | 0.264 |
| 920.8 | 0.263 |
| 920.85 | 0.263 |
| 920.9 | 0.262 |
| 920.95 | 0.261 |
| 921.0 | 0.261 |
| 921.05 | 0.26 |
| 921.1 | 0.259 |
| 921.15 | 0.258 |
| 921.2 | 0.257 |
| 921.25 | 0.256 |
| 921.3 | 0.255 |
| 921.35 | 0.254 |
| 921.4 | 0.252 |
| 921.45 | 0.251 |
| 921.5 | 0.25 |
| 921.55 | 0.249 |
| 921.6 | 0.247 |
| 921.65 | 0.246 |
| 921.7 | 0.245 |
| 921.75 | 0.244 |
| 921.8 | 0.243 |
| 921.85 | 0.241 |
| 921.9 | 0.24 |
| 921.95 | 0.239 |
| 922.0 | 0.238 |
| 922.05 | 0.237 |
| 922.1 | 0.236 |
| 922.15 | 0.235 |
| 922.2 | 0.235 |
| 922.25 | 0.234 |
| 922.3 | 0.233 |
| 922.35 | 0.233 |
| 922.4 | 0.232 |
| 922.45 | 0.232 |
| 922.5 | 0.232 |
| 922.55 | 0.231 |
| 922.6 | 0.231 |
| 922.65 | 0.231 |
| 922.7 | 0.231 |
| 922.75 | 0.231 |
| 922.8 | 0.231 |
| 922.85 | 0.232 |
| 922.9 | 0.232 |
| 922.95 | 0.232 |
| 923.0 | 0.233 |
| 923.05 | 0.233 |
| 923.1 | 0.234 |
| 923.15 | 0.235 |
| 923.2 | 0.236 |
| 923.25 | 0.237 |
| 923.3 | 0.238 |
| 923.35 | 0.239 |
| 923.4 | 0.24 |
| 923.45 | 0.241 |
| 923.5 | 0.242 |
| 923.55 | 0.243 |
| 923.6 | 0.245 |
| 923.65 | 0.246 |
| 923.7 | 0.247 |
| 923.75 | 0.248 |
| 923.8 | 0.25 |
| 923.85 | 0.251 |
| 923.9 | 0.253 |
| 923.95 | 0.254 |
| 924.0 | 0.256 |
| 924.05 | 0.258 |
| 924.1 | 0.259 |
| 924.15 | 0.261 |
| 924.2 | 0.263 |
| 924.25 | 0.264 |
| 924.3 | 0.266 |
| 924.35 | 0.268 |
| 924.4 | 0.27 |
| 924.45 | 0.272 |
| 924.5 | 0.274 |
| 924.55 | 0.275 |
| 924.6 | 0.277 |
| 924.65 | 0.279 |
| 924.7 | 0.281 |
| 924.75 | 0.283 |
| 924.8 | 0.286 |
| 924.85 | 0.288 |
| 924.9 | 0.291 |
| 924.95 | 0.293 |
| 925.0 | 0.296 |
| 925.05 | 0.298 |
| 925.1 | 0.301 |
| 925.15 | 0.304 |
| 925.2 | 0.308 |
| 925.25 | 0.311 |
| 925.3 | 0.314 |
| 925.35 | 0.317 |
| 925.4 | 0.321 |
| 925.45 | 0.324 |
| 925.5 | 0.328 |
| 925.55 | 0.332 |
| 925.6 | 0.336 |
| 925.65 | 0.341 |
| 925.7 | 0.345 |
| 925.75 | 0.348 |
| 925.8 | 0.352 |
| 925.85 | 0.356 |
| 925.9 | 0.36 |
| 925.95 | 0.364 |
| 926.0 | 0.368 |
| 926.05 | 0.372 |
| 926.1 | 0.377 |
| 926.15 | 0.381 |
| 926.2 | 0.384 |
| 926.25 | 0.389 |
| 926.3 | 0.393 |
| 926.35 | 0.396 |
| 926.4 | 0.4 |
| 926.45 | 0.404 |
| 926.5 | 0.408 |
| 926.55 | 0.412 |
| 926.6 | 0.416 |
| 926.65 | 0.419 |
| 926.7 | 0.422 |
| 926.75 | 0.425 |
| 926.8 | 0.428 |
| 926.85 | 0.431 |
| 926.9 | 0.435 |
| 926.95 | 0.438 |
| 927.0 | 0.441 |
| 927.05 | 0.443 |
| 927.1 | 0.446 |
| 927.15 | 0.449 |
| 927.2 | 0.451 |
| 927.25 | 0.453 |
| 927.3 | 0.456 |
| 927.35 | 0.458 |
| 927.4 | 0.46 |
| 927.45 | 0.462 |
| 927.5 | 0.464 |
| 927.55 | 0.466 |
| 927.6 | 0.467 |
| 927.65 | 0.469 |
| 927.7 | 0.47 |
| 927.75 | 0.471 |
| 927.8 | 0.472 |
| 927.85 | 0.473 |
| 927.9 | 0.474 |
| 927.95 | 0.475 |
| 928.0 | 0.476 |
| 928.05 | 0.476 |
| 928.1 | 0.477 |
| 928.15 | 0.478 |
| 928.2 | 0.478 |
| 928.25 | 0.479 |
| 928.3 | 0.479 |
| 928.35 | 0.479 |
| 928.4 | 0.48 |
| 928.45 | 0.48 |
| 928.5 | 0.48 |
| 928.55 | 0.481 |
| 928.6 | 0.481 |
| 928.65 | 0.481 |
| 928.7 | 0.481 |
| 928.75 | 0.482 |
| 928.8 | 0.482 |
| 928.85 | 0.482 |
| 928.9 | 0.482 |
| 928.95 | 0.483 |
| 929.0 | 0.483 |
| 929.05 | 0.483 |
| 929.1 | 0.484 |
| 929.15 | 0.484 |
| 929.2 | 0.484 |
| 929.25 | 0.485 |
| 929.3 | 0.486 |
| 929.35 | 0.486 |
| 929.4 | 0.487 |
| 929.45 | 0.488 |
| 929.5 | 0.489 |
| 929.55 | 0.49 |
| 929.6 | 0.491 |
| 929.65 | 0.492 |
| 929.7 | 0.493 |
| 929.75 | 0.494 |
| 929.8 | 0.495 |
| 929.85 | 0.496 |
| 929.9 | 0.498 |
| 929.95 | 0.499 |
| 930.0 | 0.5 |
| 930.05 | 0.502 |
| 930.1 | 0.503 |
| 930.15 | 0.504 |
| 930.2 | 0.506 |
| 930.25 | 0.507 |
| 930.3 | 0.509 |
| 930.35 | 0.51 |
| 930.4 | 0.511 |
| 930.45 | 0.512 |
| 930.5 | 0.513 |
| 930.55 | 0.515 |
| 930.6 | 0.516 |
| 930.65 | 0.517 |
| 930.7 | 0.518 |
| 930.75 | 0.519 |
| 930.8 | 0.52 |
| 930.85 | 0.521 |
| 930.9 | 0.522 |
| 930.95 | 0.523 |
| 931.0 | 0.524 |
| 931.05 | 0.525 |
| 931.1 | 0.526 |
| 931.15 | 0.527 |
| 931.2 | 0.527 |
| 931.25 | 0.528 |
| 931.3 | 0.529 |
| 931.35 | 0.529 |
| 931.4 | 0.529 |
| 931.45 | 0.53 |
| 931.5 | 0.53 |
| 931.55 | 0.53 |
| 931.6 | 0.53 |
| 931.65 | 0.53 |
| 931.7 | 0.53 |
| 931.75 | 0.53 |
| 931.8 | 0.529 |
| 931.85 | 0.529 |
| 931.9 | 0.528 |
| 931.95 | 0.528 |
| 932.0 | 0.527 |
| 932.05 | 0.526 |
| 932.1 | 0.525 |
| 932.15 | 0.524 |
| 932.2 | 0.523 |
| 932.25 | 0.522 |
| 932.3 | 0.521 |
| 932.35 | 0.519 |
| 932.4 | 0.517 |
| 932.45 | 0.516 |
| 932.5 | 0.514 |
| 932.55 | 0.513 |
| 932.6 | 0.511 |
| 932.65 | 0.509 |
| 932.7 | 0.508 |
| 932.75 | 0.506 |
| 932.8 | 0.504 |
| 932.85 | 0.502 |
| 932.9 | 0.501 |
| 932.95 | 0.499 |
| 933.0 | 0.498 |
| 933.05 | 0.496 |
| 933.1 | 0.494 |
| 933.15 | 0.493 |
| 933.2 | 0.491 |
| 933.25 | 0.49 |
| 933.3 | 0.489 |
| 933.35 | 0.487 |
| 933.4 | 0.486 |
| 933.45 | 0.485 |
| 933.5 | 0.484 |
| 933.55 | 0.483 |
| 933.6 | 0.482 |
| 933.65 | 0.481 |
| 933.7 | 0.48 |
| 933.75 | 0.48 |
| 933.8 | 0.479 |
| 933.85 | 0.479 |
| 933.9 | 0.479 |
| 933.95 | 0.479 |
| 934.0 | 0.479 |
| 934.05 | 0.479 |
| 934.1 | 0.479 |
| 934.15 | 0.48 |
| 934.2 | 0.48 |
| 934.25 | 0.48 |
| 934.3 | 0.481 |
| 934.35 | 0.482 |
| 934.4 | 0.483 |
| 934.45 | 0.484 |
| 934.5 | 0.485 |
| 934.55 | 0.486 |
| 934.6 | 0.487 |
| 934.65 | 0.488 |
| 934.7 | 0.49 |
| 934.75 | 0.491 |
| 934.8 | 0.492 |
| 934.85 | 0.494 |
| 934.9 | 0.495 |
| 934.95 | 0.497 |
| 935.0 | 0.499 |
| 935.05 | 0.5 |
| 935.1 | 0.502 |
| 935.15 | 0.504 |
| 935.2 | 0.505 |
| 935.25 | 0.507 |
| 935.3 | 0.509 |
| 935.35 | 0.511 |
| 935.4 | 0.514 |
| 935.45 | 0.516 |
| 935.5 | 0.518 |
| 935.55 | 0.52 |
| 935.6 | 0.523 |
| 935.65 | 0.525 |
| 935.7 | 0.528 |
| 935.75 | 0.531 |
| 935.8 | 0.534 |
| 935.85 | 0.536 |
| 935.9 | 0.539 |
| 935.95 | 0.541 |
| 936.0 | 0.544 |
| 936.05 | 0.547 |
| 936.1 | 0.55 |
| 936.15 | 0.553 |
| 936.2 | 0.556 |
| 936.25 | 0.558 |
| 936.3 | 0.561 |
| 936.35 | 0.564 |
| 936.4 | 0.567 |
| 936.45 | 0.569 |
| 936.5 | 0.573 |
| 936.55 | 0.576 |
| 936.6 | 0.579 |
| 936.65 | 0.582 |
| 936.7 | 0.585 |
| 936.75 | 0.589 |
| 936.8 | 0.592 |
| 936.85 | 0.595 |
| 936.9 | 0.599 |
| 936.95 | 0.602 |
| 937.0 | 0.606 |
| 937.05 | 0.61 |
| 937.1 | 0.613 |
| 937.15 | 0.617 |
| 937.2 | 0.62 |
| 937.25 | 0.624 |
| 937.3 | 0.627 |
| 937.35 | 0.631 |
| 937.4 | 0.635 |
| 937.45 | 0.639 |
| 937.5 | 0.644 |
| 937.55 | 0.648 |
| 937.6 | 0.652 |
| 937.65 | 0.657 |
| 937.7 | 0.661 |
| 937.75 | 0.666 |
| 937.8 | 0.67 |
| 937.85 | 0.675 |
| 937.9 | 0.68 |
| 937.95 | 0.685 |
| 938.0 | 0.689 |
| 938.05 | 0.693 |
| 938.1 | 0.697 |
| 938.15 | 0.701 |
| 938.2 | 0.705 |
| 938.25 | 0.708 |
| 938.3 | 0.712 |
| 938.35 | 0.715 |
| 938.4 | 0.717 |
| 938.45 | 0.719 |
| 938.5 | 0.721 |
| 938.55 | 0.723 |
| 938.6 | 0.724 |
| 938.65 | 0.725 |
| 938.7 | 0.726 |
| 938.75 | 0.727 |
| 938.8 | 0.727 |
| 938.85 | 0.727 |
| 938.9 | 0.727 |
| 938.95 | 0.726 |
| 939.0 | 0.726 |
| 939.05 | 0.725 |
| 939.1 | 0.724 |
| 939.15 | 0.723 |
| 939.2 | 0.722 |
| 939.25 | 0.721 |
| 939.3 | 0.72 |
| 939.35 | 0.719 |
| 939.4 | 0.718 |
| 939.45 | 0.717 |
| 939.5 | 0.716 |
| 939.55 | 0.714 |
| 939.6 | 0.713 |
| 939.65 | 0.712 |
| 939.7 | 0.711 |
| 939.75 | 0.71 |
| 939.8 | 0.709 |
| 939.85 | 0.708 |
| 939.9 | 0.707 |
| 939.95 | 0.706 |
| 940.0 | 0.705 |
| 940.05 | 0.704 |
| 940.1 | 0.704 |
| 940.15 | 0.704 |
| 940.2 | 0.704 |
| 940.25 | 0.704 |
| 940.3 | 0.704 |
| 940.35 | 0.704 |
| 940.4 | 0.705 |
| 940.45 | 0.706 |
| 940.5 | 0.707 |
| 940.55 | 0.708 |
| 940.6 | 0.71 |
| 940.65 | 0.711 |
| 940.7 | 0.713 |
| 940.75 | 0.715 |
| 940.8 | 0.717 |
| 940.85 | 0.719 |
| 940.9 | 0.722 |
| 940.95 | 0.725 |
| 941.0 | 0.728 |
| 941.05 | 0.731 |
| 941.1 | 0.735 |
| 941.15 | 0.738 |
| 941.2 | 0.742 |
| 941.25 | 0.745 |
| 941.3 | 0.749 |
| 941.35 | 0.753 |
| 941.4 | 0.757 |
| 941.45 | 0.761 |
| 941.5 | 0.765 |
| 941.55 | 0.769 |
| 941.6 | 0.773 |
| 941.65 | 0.777 |
| 941.7 | 0.781 |
| 941.75 | 0.785 |
| 941.8 | 0.79 |
| 941.85 | 0.794 |
| 941.9 | 0.798 |
| 941.95 | 0.802 |
| 942.0 | 0.806 |
| 942.05 | 0.809 |
| 942.1 | 0.813 |
| 942.15 | 0.818 |
| 942.2 | 0.821 |
| 942.25 | 0.825 |
| 942.3 | 0.829 |
| 942.35 | 0.832 |
| 942.4 | 0.835 |
| 942.45 | 0.839 |
| 942.5 | 0.842 |
| 942.55 | 0.844 |
| 942.6 | 0.847 |
| 942.65 | 0.849 |
| 942.7 | 0.851 |
| 942.75 | 0.853 |
| 942.8 | 0.854 |
| 942.85 | 0.855 |
| 942.9 | 0.856 |
| 942.95 | 0.857 |
| 943.0 | 0.857 |
| 943.05 | 0.857 |
| 943.1 | 0.857 |
| 943.15 | 0.857 |
| 943.2 | 0.856 |
| 943.25 | 0.855 |
| 943.3 | 0.855 |
| 943.35 | 0.853 |
| 943.4 | 0.852 |
| 943.45 | 0.85 |
| 943.5 | 0.848 |
| 943.55 | 0.845 |
| 943.6 | 0.843 |
| 943.65 | 0.84 |
| 943.7 | 0.837 |
| 943.75 | 0.834 |
| 943.8 | 0.831 |
| 943.85 | 0.827 |
| 943.9 | 0.823 |
| 943.95 | 0.818 |
| 944.0 | 0.813 |
| 944.05 | 0.808 |
| 944.1 | 0.803 |
| 944.15 | 0.796 |
| 944.2 | 0.791 |
| 944.25 | 0.784 |
| 944.3 | 0.777 |
| 944.35 | 0.77 |
| 944.4 | 0.761 |
| 944.45 | 0.753 |
| 944.5 | 0.746 |
| 944.55 | 0.738 |
| 944.6 | 0.73 |
| 944.65 | 0.722 |
| 944.7 | 0.714 |
| 944.75 | 0.705 |
| 944.8 | 0.696 |
| 944.85 | 0.687 |
| 944.9 | 0.679 |
| 944.95 | 0.671 |
| 945.0 | 0.664 |
| 945.05 | 0.656 |
| 945.1 | 0.648 |
| 945.15 | 0.64 |
| 945.2 | 0.631 |
| 945.25 | 0.621 |
| 945.3 | 0.614 |
| 945.35 | 0.606 |
| 945.4 | 0.598 |
| 945.45 | 0.591 |
| 945.5 | 0.583 |
| 945.55 | 0.576 |
| 945.6 | 0.568 |
| 945.65 | 0.56 |
| 945.7 | 0.553 |
| 945.75 | 0.547 |
| 945.8 | 0.541 |
| 945.85 | 0.535 |
| 945.9 | 0.529 |
| 945.95 | 0.523 |
| 946.0 | 0.517 |
| 946.05 | 0.511 |
| 946.1 | 0.504 |
| 946.15 | 0.499 |
| 946.2 | 0.493 |
| 946.25 | 0.487 |
| 946.3 | 0.481 |
| 946.35 | 0.476 |
| 946.4 | 0.471 |
| 946.45 | 0.465 |
| 946.5 | 0.459 |
| 946.55 | 0.453 |
| 946.6 | 0.448 |
| 946.65 | 0.443 |
| 946.7 | 0.438 |
| 946.75 | 0.434 |
| 946.8 | 0.429 |
| 946.85 | 0.425 |
| 946.9 | 0.42 |
| 946.95 | 0.415 |
| 947.0 | 0.41 |
| 947.05 | 0.406 |
| 947.1 | 0.402 |
| 947.15 | 0.398 |
| 947.2 | 0.395 |
| 947.25 | 0.391 |
| 947.3 | 0.387 |
| 947.35 | 0.382 |
| 947.4 | 0.378 |
| 947.45 | 0.374 |
| 947.5 | 0.37 |
| 947.55 | 0.367 |
| 947.6 | 0.363 |
| 947.65 | 0.359 |
| 947.7 | 0.355 |
| 947.75 | 0.351 |
| 947.8 | 0.348 |
| 947.85 | 0.344 |
| 947.9 | 0.341 |
| 947.95 | 0.338 |
| 948.0 | 0.335 |
| 948.05 | 0.332 |
| 948.1 | 0.329 |
| 948.15 | 0.327 |
| 948.2 | 0.324 |
| 948.25 | 0.321 |
| 948.3 | 0.318 |
| 948.35 | 0.314 |
| 948.4 | 0.311 |
| 948.45 | 0.308 |
| 948.5 | 0.305 |
| 948.55 | 0.302 |
| 948.6 | 0.299 |
| 948.65 | 0.295 |
| 948.7 | 0.291 |
| 948.75 | 0.288 |
| 948.8 | 0.285 |
| 948.85 | 0.282 |
| 948.9 | 0.279 |
| 948.95 | 0.276 |
| 949.0 | 0.273 |
| 949.05 | 0.271 |
| 949.1 | 0.268 |
| 949.15 | 0.265 |
| 949.2 | 0.263 |
| 949.25 | 0.26 |
| 949.3 | 0.258 |
| 949.35 | 0.256 |
| 949.4 | 0.254 |
| 949.45 | 0.252 |
| 949.5 | 0.25 |
| 949.55 | 0.248 |
| 949.6 | 0.246 |
| 949.65 | 0.245 |
| 949.7 | 0.243 |
| 949.75 | 0.241 |
| 949.8 | 0.24 |
| 949.85 | 0.239 |
| 949.9 | 0.238 |
| 949.95 | 0.236 |
| 950.0 | 0.235 |
| 950.05 | 0.234 |
| 950.1 | 0.233 |
| 950.15 | 0.233 |
| 950.2 | 0.232 |
| 950.25 | 0.231 |
| 950.3 | 0.23 |
| 950.35 | 0.23 |
| 950.4 | 0.229 |
| 950.45 | 0.229 |
| 950.5 | 0.228 |
| 950.55 | 0.227 |
| 950.6 | 0.227 |
| 950.65 | 0.226 |
| 950.7 | 0.226 |
| 950.75 | 0.225 |
| 950.8 | 0.225 |
| 950.85 | 0.224 |
| 950.9 | 0.224 |
| 950.95 | 0.224 |
| 951.0 | 0.223 |
| 951.05 | 0.222 |
| 951.1 | 0.222 |
| 951.15 | 0.221 |
| 951.2 | 0.221 |
| 951.25 | 0.22 |
| 951.3 | 0.22 |
| 951.35 | 0.219 |
| 951.4 | 0.219 |
| 951.45 | 0.218 |
| 951.5 | 0.218 |
| 951.55 | 0.217 |
| 951.6 | 0.217 |
| 951.65 | 0.216 |
| 951.7 | 0.216 |
| 951.75 | 0.215 |
| 951.8 | 0.215 |
| 951.85 | 0.214 |
| 951.9 | 0.214 |
| 951.95 | 0.214 |
| 952.0 | 0.213 |
| 952.05 | 0.213 |
| 952.1 | 0.212 |
| 952.15 | 0.212 |
| 952.2 | 0.212 |
| 952.25 | 0.211 |
| 952.3 | 0.211 |
| 952.35 | 0.211 |
| 952.4 | 0.21 |
| 952.45 | 0.21 |
| 952.5 | 0.21 |
| 952.55 | 0.209 |
| 952.6 | 0.209 |
| 952.65 | 0.209 |
| 952.7 | 0.209 |
| 952.75 | 0.208 |
| 952.8 | 0.208 |
| 952.85 | 0.208 |
| 952.9 | 0.208 |
| 952.95 | 0.207 |
| 953.0 | 0.207 |
| 953.05 | 0.207 |
| 953.1 | 0.206 |
| 953.15 | 0.206 |
| 953.2 | 0.205 |
| 953.25 | 0.205 |
| 953.3 | 0.205 |
| 953.35 | 0.204 |
| 953.4 | 0.204 |
| 953.45 | 0.204 |
| 953.5 | 0.203 |
| 953.55 | 0.203 |
| 953.6 | 0.202 |
| 953.65 | 0.202 |
| 953.7 | 0.201 |
| 953.75 | 0.201 |
| 953.8 | 0.2 |
| 953.85 | 0.2 |
| 953.9 | 0.199 |
| 953.95 | 0.198 |
| 954.0 | 0.197 |
| 954.05 | 0.197 |
| 954.1 | 0.196 |
| 954.15 | 0.195 |
| 954.2 | 0.194 |
| 954.25 | 0.193 |
| 954.3 | 0.192 |
| 954.35 | 0.191 |
| 954.4 | 0.19 |
| 954.45 | 0.189 |
| 954.5 | 0.188 |
| 954.55 | 0.187 |
| 954.6 | 0.186 |
| 954.65 | 0.185 |
| 954.7 | 0.184 |
| 954.75 | 0.183 |
| 954.8 | 0.181 |
| 954.85 | 0.18 |
| 954.9 | 0.179 |
| 954.95 | 0.178 |
| 955.0 | 0.176 |
| 955.05 | 0.175 |
| 955.1 | 0.174 |
| 955.15 | 0.173 |
| 955.2 | 0.171 |
| 955.25 | 0.17 |
| 955.3 | 0.168 |
| 955.35 | 0.167 |
| 955.4 | 0.166 |
| 955.45 | 0.165 |
| 955.5 | 0.164 |
| 955.55 | 0.164 |
| 955.6 | 0.163 |
| 955.65 | 0.162 |
| 955.7 | 0.161 |
| 955.75 | 0.161 |
| 955.8 | 0.16 |
| 955.85 | 0.16 |
| 955.9 | 0.159 |
| 955.95 | 0.159 |
| 956.0 | 0.159 |
| 956.05 | 0.158 |
| 956.1 | 0.158 |
| 956.15 | 0.158 |
| 956.2 | 0.158 |
| 956.25 | 0.158 |
| 956.3 | 0.158 |
| 956.35 | 0.158 |
| 956.4 | 0.159 |
| 956.45 | 0.159 |
| 956.5 | 0.159 |
| 956.55 | 0.159 |
| 956.6 | 0.16 |
| 956.65 | 0.16 |
| 956.7 | 0.16 |
| 956.75 | 0.161 |
| 956.8 | 0.161 |
| 956.85 | 0.162 |
| 956.9 | 0.162 |
| 956.95 | 0.163 |
| 957.0 | 0.163 |
| 957.05 | 0.164 |
| 957.1 | 0.165 |
| 957.15 | 0.165 |
| 957.2 | 0.166 |
| 957.25 | 0.167 |
| 957.3 | 0.168 |
| 957.35 | 0.168 |
| 957.4 | 0.169 |
| 957.45 | 0.17 |
| 957.5 | 0.171 |
| 957.55 | 0.172 |
| 957.6 | 0.173 |
| 957.65 | 0.173 |
| 957.7 | 0.174 |
| 957.75 | 0.175 |
| 957.8 | 0.176 |
| 957.85 | 0.176 |
| 957.9 | 0.177 |
| 957.95 | 0.178 |
| 958.0 | 0.178 |
| 958.05 | 0.179 |
| 958.1 | 0.179 |
| 958.15 | 0.18 |
| 958.2 | 0.18 |
| 958.25 | 0.18 |
| 958.3 | 0.18 |
| 958.35 | 0.181 |
| 958.4 | 0.181 |
| 958.45 | 0.181 |
| 958.5 | 0.181 |
| 958.55 | 0.181 |
| 958.6 | 0.181 |
| 958.65 | 0.181 |
| 958.7 | 0.181 |
| 958.75 | 0.181 |
| 958.8 | 0.18 |
| 958.85 | 0.18 |
| 958.9 | 0.18 |
| 958.95 | 0.18 |
| 959.0 | 0.18 |
| 959.05 | 0.18 |
| 959.1 | 0.18 |
| 959.15 | 0.18 |
| 959.2 | 0.18 |
| 959.25 | 0.18 |
| 959.3 | 0.18 |
| 959.35 | 0.18 |
| 959.4 | 0.18 |
| 959.45 | 0.18 |
| 959.5 | 0.18 |
| 959.55 | 0.181 |
| 959.6 | 0.181 |
| 959.65 | 0.181 |
| 959.7 | 0.182 |
| 959.75 | 0.182 |
| 959.8 | 0.183 |
| 959.85 | 0.183 |
| 959.9 | 0.184 |
| 959.95 | 0.184 |
| 960.0 | 0.185 |
| 960.05 | 0.185 |
| 960.1 | 0.186 |
| 960.15 | 0.186 |
| 960.2 | 0.187 |
| 960.25 | 0.187 |
| 960.3 | 0.187 |
| 960.35 | 0.188 |
| 960.4 | 0.188 |
| 960.45 | 0.188 |
| 960.5 | 0.188 |
| 960.55 | 0.189 |
| 960.6 | 0.189 |
| 960.65 | 0.189 |
| 960.7 | 0.189 |
| 960.75 | 0.189 |
| 960.8 | 0.188 |
| 960.85 | 0.188 |
| 960.9 | 0.188 |
| 960.95 | 0.188 |
| 961.0 | 0.188 |
| 961.05 | 0.187 |
| 961.1 | 0.187 |
| 961.15 | 0.187 |
| 961.2 | 0.186 |
| 961.25 | 0.186 |
| 961.3 | 0.185 |
| 961.35 | 0.185 |
| 961.4 | 0.184 |
| 961.45 | 0.184 |
| 961.5 | 0.183 |
| 961.55 | 0.182 |
| 961.6 | 0.181 |
| 961.65 | 0.181 |
| 961.7 | 0.18 |
| 961.75 | 0.179 |
| 961.8 | 0.178 |
| 961.85 | 0.177 |
| 961.9 | 0.176 |
| 961.95 | 0.175 |
| 962.0 | 0.174 |
| 962.05 | 0.173 |
| 962.1 | 0.172 |
| 962.15 | 0.171 |
| 962.2 | 0.17 |
| 962.25 | 0.168 |
| 962.3 | 0.167 |
| 962.35 | 0.166 |
| 962.4 | 0.165 |
| 962.45 | 0.163 |
| 962.5 | 0.162 |
| 962.55 | 0.161 |
| 962.6 | 0.16 |
| 962.65 | 0.158 |
| 962.7 | 0.156 |
| 962.75 | 0.155 |
| 962.8 | 0.154 |
| 962.85 | 0.152 |
| 962.9 | 0.151 |
| 962.95 | 0.15 |
| 963.0 | 0.148 |
| 963.05 | 0.147 |
| 963.1 | 0.145 |
| 963.15 | 0.144 |
| 963.2 | 0.143 |
| 963.25 | 0.141 |
| 963.3 | 0.14 |
| 963.35 | 0.139 |
| 963.4 | 0.138 |
| 963.45 | 0.137 |
| 963.5 | 0.136 |
| 963.55 | 0.135 |
| 963.6 | 0.134 |
| 963.65 | 0.133 |
| 963.7 | 0.132 |
| 963.75 | 0.131 |
| 963.8 | 0.13 |
| 963.85 | 0.129 |
| 963.9 | 0.128 |
| 963.95 | 0.127 |
| 964.0 | 0.126 |
| 964.05 | 0.125 |
| 964.1 | 0.125 |
| 964.15 | 0.124 |
| 964.2 | 0.124 |
| 964.25 | 0.123 |
| 964.3 | 0.123 |
| 964.35 | 0.122 |
| 964.4 | 0.122 |
| 964.45 | 0.121 |
| 964.5 | 0.121 |
| 964.55 | 0.121 |
| 964.6 | 0.121 |
| 964.65 | 0.121 |
| 964.7 | 0.121 |
| 964.75 | 0.121 |
| 964.8 | 0.121 |
| 964.85 | 0.121 |
| 964.9 | 0.121 |
| 964.95 | 0.121 |
| 965.0 | 0.121 |
| 965.05 | 0.122 |
| 965.1 | 0.122 |
| 965.15 | 0.122 |
| 965.2 | 0.122 |
| 965.25 | 0.123 |
| 965.3 | 0.123 |
| 965.35 | 0.123 |
| 965.4 | 0.124 |
| 965.45 | 0.124 |
| 965.5 | 0.125 |
| 965.55 | 0.125 |
| 965.6 | 0.126 |
| 965.65 | 0.126 |
| 965.7 | 0.127 |
| 965.75 | 0.127 |
| 965.8 | 0.128 |
| 965.85 | 0.129 |
| 965.9 | 0.129 |
| 965.95 | 0.13 |
| 966.0 | 0.131 |
| 966.05 | 0.132 |
| 966.1 | 0.132 |
| 966.15 | 0.133 |
| 966.2 | 0.134 |
| 966.25 | 0.136 |
| 966.3 | 0.136 |
| 966.35 | 0.138 |
| 966.4 | 0.139 |
| 966.45 | 0.14 |
| 966.5 | 0.141 |
| 966.55 | 0.142 |
| 966.6 | 0.143 |
| 966.65 | 0.144 |
| 966.7 | 0.145 |
| 966.75 | 0.147 |
| 966.8 | 0.148 |
| 966.85 | 0.149 |
| 966.9 | 0.15 |
| 966.95 | 0.152 |
| 967.0 | 0.153 |
| 967.05 | 0.155 |
| 967.1 | 0.156 |
| 967.15 | 0.158 |
| 967.2 | 0.16 |
| 967.25 | 0.162 |
| 967.3 | 0.163 |
| 967.35 | 0.165 |
| 967.4 | 0.167 |
| 967.45 | 0.169 |
| 967.5 | 0.172 |
| 967.55 | 0.174 |
| 967.6 | 0.176 |
| 967.65 | 0.178 |
| 967.7 | 0.18 |
| 967.75 | 0.183 |
| 967.8 | 0.185 |
| 967.85 | 0.188 |
| 967.9 | 0.191 |
| 967.95 | 0.194 |
| 968.0 | 0.197 |
| 968.05 | 0.201 |
| 968.1 | 0.205 |
| 968.15 | 0.208 |
| 968.2 | 0.212 |
| 968.25 | 0.217 |
| 968.3 | 0.221 |
| 968.35 | 0.227 |
| 968.4 | 0.233 |
| 968.45 | 0.239 |
| 968.5 | 0.245 |
| 968.55 | 0.252 |
| 968.6 | 0.258 |
| 968.65 | 0.266 |
| 968.7 | 0.273 |
| 968.75 | 0.281 |
| 968.8 | 0.29 |
| 968.85 | 0.299 |
| 968.9 | 0.308 |
| 968.95 | 0.317 |
| 969.0 | 0.327 |
| 969.05 | 0.336 |
| 969.1 | 0.347 |
| 969.15 | 0.357 |
| 969.2 | 0.37 |
| 969.25 | 0.384 |
| 969.3 | 0.399 |
| 969.35 | 0.412 |
| 969.4 | 0.427 |
| 969.45 | 0.441 |
| 969.5 | 0.457 |
| 969.55 | 0.474 |
| 969.6 | 0.49 |
| 969.65 | 0.507 |
| 969.7 | 0.526 |
| 969.75 | 0.543 |
| 969.8 | 0.559 |
| 969.85 | 0.576 |
| 969.9 | 0.593 |
| 969.95 | 0.609 |
| 970.0 | 0.626 |
| 970.05 | 0.643 |
| 970.1 | 0.66 |
| 970.15 | 0.681 |
| 970.2 | 0.701 |
| 970.25 | 0.718 |
| 970.3 | 0.734 |
| 970.35 | 0.751 |
| 970.4 | 0.766 |
| 970.45 | 0.782 |
| 970.5 | 0.796 |
| 970.55 | 0.809 |
| 970.6 | 0.819 |
| 970.65 | 0.826 |
| 970.7 | 0.829 |
| 970.75 | 0.83 |
| 970.8 | 0.83 |
| 970.85 | 0.827 |
| 970.9 | 0.821 |
| 970.95 | 0.813 |
| 971.0 | 0.8 |
| 971.05 | 0.784 |
| 971.1 | 0.768 |
| 971.15 | 0.75 |
| 971.2 | 0.732 |
| 971.25 | 0.712 |
| 971.3 | 0.691 |
| 971.35 | 0.669 |
| 971.4 | 0.645 |
| 971.45 | 0.62 |
| 971.5 | 0.595 |
| 971.55 | 0.571 |
| 971.6 | 0.548 |
| 971.65 | 0.524 |
| 971.7 | 0.502 |
| 971.75 | 0.48 |
| 971.8 | 0.46 |
| 971.85 | 0.44 |
| 971.9 | 0.419 |
| 971.95 | 0.4 |
| 972.0 | 0.383 |
| 972.05 | 0.367 |
| 972.1 | 0.352 |
| 972.15 | 0.338 |
| 972.2 | 0.324 |
| 972.25 | 0.311 |
| 972.3 | 0.296 |
| 972.35 | 0.282 |
| 972.4 | 0.269 |
| 972.45 | 0.258 |
| 972.5 | 0.247 |
| 972.55 | 0.236 |
| 972.6 | 0.226 |
| 972.65 | 0.216 |
| 972.7 | 0.207 |
| 972.75 | 0.197 |
| 972.8 | 0.188 |
| 972.85 | 0.18 |
| 972.9 | 0.173 |
| 972.95 | 0.166 |
| 973.0 | 0.16 |
| 973.05 | 0.154 |
| 973.1 | 0.148 |
| 973.15 | 0.142 |
| 973.2 | 0.137 |
| 973.25 | 0.132 |
| 973.3 | 0.128 |
| 973.35 | 0.124 |
| 973.4 | 0.12 |
| 973.45 | 0.117 |
| 973.5 | 0.114 |
| 973.55 | 0.111 |
| 973.6 | 0.108 |
| 973.65 | 0.105 |
| 973.7 | 0.102 |
| 973.75 | 0.1 |
| 973.8 | 0.097 |
| 973.85 | 0.095 |
| 973.9 | 0.093 |
| 973.95 | 0.091 |
| 974.0 | 0.089 |
| 974.05 | 0.087 |
| 974.1 | 0.085 |
| 974.15 | 0.083 |
| 974.2 | 0.082 |
| 974.25 | 0.081 |
| 974.3 | 0.079 |
| 974.35 | 0.078 |
| 974.4 | 0.077 |
| 974.45 | 0.076 |
| 974.5 | 0.074 |
| 974.55 | 0.073 |
| 974.6 | 0.072 |
| 974.65 | 0.071 |
| 974.7 | 0.07 |
| 974.75 | 0.069 |
| 974.8 | 0.069 |
| 974.85 | 0.068 |
| 974.9 | 0.067 |
| 974.95 | 0.066 |
| 975.0 | 0.065 |
| 975.05 | 0.064 |
| 975.1 | 0.064 |
| 975.15 | 0.063 |
| 975.2 | 0.062 |
| 975.25 | 0.062 |
| 975.3 | 0.061 |
| 975.35 | 0.061 |
| 975.4 | 0.06 |
| 975.45 | 0.06 |
| 975.5 | 0.059 |
| 975.55 | 0.059 |
| 975.6 | 0.058 |
| 975.65 | 0.058 |
| 975.7 | 0.058 |
| 975.75 | 0.057 |
| 975.8 | 0.057 |
| 975.85 | 0.057 |
| 975.9 | 0.057 |
| 975.95 | 0.056 |
| 976.0 | 0.056 |
| 976.05 | 0.056 |
| 976.1 | 0.056 |
| 976.15 | 0.056 |
| 976.2 | 0.056 |
| 976.25 | 0.056 |
| 976.3 | 0.056 |
| 976.35 | 0.056 |
| 976.4 | 0.056 |
| 976.45 | 0.056 |
| 976.5 | 0.056 |
| 976.55 | 0.056 |
| 976.6 | 0.056 |
| 976.65 | 0.056 |
| 976.7 | 0.056 |
| 976.75 | 0.057 |
| 976.8 | 0.057 |
| 976.85 | 0.057 |
| 976.9 | 0.057 |
| 976.95 | 0.057 |
| 977.0 | 0.058 |
| 977.05 | 0.058 |
| 977.1 | 0.058 |
| 977.15 | 0.059 |
| 977.2 | 0.059 |
| 977.25 | 0.06 |
| 977.3 | 0.06 |
| 977.35 | 0.061 |
| 977.4 | 0.062 |
| 977.45 | 0.062 |
| 977.5 | 0.063 |
| 977.55 | 0.063 |
| 977.6 | 0.064 |
| 977.65 | 0.065 |
| 977.7 | 0.065 |
| 977.75 | 0.066 |
| 977.8 | 0.067 |
| 977.85 | 0.068 |
| 977.9 | 0.068 |
| 977.95 | 0.069 |
| 978.0 | 0.07 |
| 978.05 | 0.071 |
| 978.1 | 0.071 |
| 978.15 | 0.072 |
| 978.2 | 0.073 |
| 978.25 | 0.074 |
| 978.3 | 0.075 |
| 978.35 | 0.075 |
| 978.4 | 0.076 |
| 978.45 | 0.077 |
| 978.5 | 0.078 |
| 978.55 | 0.079 |
| 978.6 | 0.079 |
| 978.65 | 0.08 |
| 978.7 | 0.081 |
| 978.75 | 0.081 |
| 978.8 | 0.082 |
| 978.85 | 0.082 |
| 978.9 | 0.083 |
| 978.95 | 0.083 |
| 979.0 | 0.084 |
| 979.05 | 0.084 |
| 979.1 | 0.085 |
| 979.15 | 0.085 |
| 979.2 | 0.086 |
| 979.25 | 0.086 |
| 979.3 | 0.087 |
| 979.35 | 0.087 |
| 979.4 | 0.087 |
| 979.45 | 0.088 |
| 979.5 | 0.088 |
| 979.55 | 0.088 |
| 979.6 | 0.089 |
| 979.65 | 0.089 |
| 979.7 | 0.089 |
| 979.75 | 0.089 |
| 979.8 | 0.089 |
| 979.85 | 0.09 |
| 979.9 | 0.09 |
| 979.95 | 0.09 |
| 980.0 | 0.09 |
| 980.05 | 0.09 |
| 980.1 | 0.09 |
| 980.15 | 0.09 |
| 980.2 | 0.09 |
| 980.25 | 0.09 |
| 980.3 | 0.09 |
| 980.35 | 0.09 |
| 980.4 | 0.09 |
| 980.45 | 0.09 |
| 980.5 | 0.09 |
| 980.55 | 0.09 |
| 980.6 | 0.089 |
| 980.65 | 0.089 |
| 980.7 | 0.089 |
| 980.75 | 0.089 |
| 980.8 | 0.088 |
| 980.85 | 0.088 |
| 980.9 | 0.088 |
| 980.95 | 0.088 |
| 981.0 | 0.087 |
| 981.05 | 0.087 |
| 981.1 | 0.087 |
| 981.15 | 0.086 |
| 981.2 | 0.086 |
| 981.25 | 0.085 |
| 981.3 | 0.085 |
| 981.35 | 0.085 |
| 981.4 | 0.084 |
| 981.45 | 0.084 |
| 981.5 | 0.083 |
| 981.55 | 0.083 |
| 981.6 | 0.082 |
| 981.65 | 0.082 |
| 981.7 | 0.081 |
| 981.75 | 0.081 |
| 981.8 | 0.081 |
| 981.85 | 0.08 |
| 981.9 | 0.08 |
| 981.95 | 0.08 |
| 982.0 | 0.079 |
| 982.05 | 0.079 |
| 982.1 | 0.079 |
| 982.15 | 0.079 |
| 982.2 | 0.078 |
| 982.25 | 0.078 |
| 982.3 | 0.078 |
| 982.35 | 0.078 |
| 982.4 | 0.078 |
| 982.45 | 0.077 |
| 982.5 | 0.077 |
| 982.55 | 0.077 |
| 982.6 | 0.077 |
| 982.65 | 0.077 |
| 982.7 | 0.077 |
| 982.75 | 0.077 |
| 982.8 | 0.077 |
| 982.85 | 0.077 |
| 982.9 | 0.076 |
| 982.95 | 0.076 |
| 983.0 | 0.076 |
| 983.05 | 0.076 |
| 983.1 | 0.076 |
| 983.15 | 0.076 |
| 983.2 | 0.075 |
| 983.25 | 0.075 |
| 983.3 | 0.075 |
| 983.35 | 0.075 |
| 983.4 | 0.074 |
| 983.45 | 0.074 |
| 983.5 | 0.074 |
| 983.55 | 0.073 |
| 983.6 | 0.073 |
| 983.65 | 0.072 |
| 983.7 | 0.072 |
| 983.75 | 0.071 |
| 983.8 | 0.071 |
| 983.85 | 0.07 |
| 983.9 | 0.07 |
| 983.95 | 0.069 |
| 984.0 | 0.069 |
| 984.05 | 0.068 |
| 984.1 | 0.068 |
| 984.15 | 0.067 |
| 984.2 | 0.067 |
| 984.25 | 0.066 |
| 984.3 | 0.066 |
| 984.35 | 0.065 |
| 984.4 | 0.065 |
| 984.45 | 0.064 |
| 984.5 | 0.064 |
| 984.55 | 0.064 |
| 984.6 | 0.063 |
| 984.65 | 0.063 |
| 984.7 | 0.062 |
| 984.75 | 0.062 |
| 984.8 | 0.061 |
| 984.85 | 0.061 |
| 984.9 | 0.06 |
| 984.95 | 0.06 |
| 985.0 | 0.06 |
| 985.05 | 0.059 |
| 985.1 | 0.059 |
| 985.15 | 0.059 |
| 985.2 | 0.058 |
| 985.25 | 0.058 |
| 985.3 | 0.058 |
| 985.35 | 0.057 |
| 985.4 | 0.057 |
| 985.45 | 0.057 |
| 985.5 | 0.056 |
| 985.55 | 0.056 |
| 985.6 | 0.056 |
| 985.65 | 0.056 |
| 985.7 | 0.055 |
| 985.75 | 0.055 |
| 985.8 | 0.055 |
| 985.85 | 0.055 |
| 985.9 | 0.054 |
| 985.95 | 0.054 |
| 986.0 | 0.054 |
| 986.05 | 0.054 |
| 986.1 | 0.054 |
| 986.15 | 0.054 |
| 986.2 | 0.054 |
| 986.25 | 0.053 |
| 986.3 | 0.053 |
| 986.35 | 0.053 |
| 986.4 | 0.053 |
| 986.45 | 0.053 |
| 986.5 | 0.053 |
| 986.55 | 0.053 |
| 986.6 | 0.053 |
| 986.65 | 0.053 |
| 986.7 | 0.053 |
| 986.75 | 0.053 |
| 986.8 | 0.053 |
| 986.85 | 0.053 |
| 986.9 | 0.053 |
| 986.95 | 0.053 |
| 987.0 | 0.053 |
| 987.05 | 0.053 |
| 987.1 | 0.053 |
| 987.15 | 0.053 |
| 987.2 | 0.052 |
| 987.25 | 0.052 |
| 987.3 | 0.052 |
| 987.35 | 0.052 |
| 987.4 | 0.052 |
| 987.45 | 0.052 |
| 987.5 | 0.052 |
| 987.55 | 0.052 |
| 987.6 | 0.052 |
| 987.65 | 0.052 |
| 987.7 | 0.052 |
| 987.75 | 0.052 |
| 987.8 | 0.052 |
| 987.85 | 0.052 |
| 987.9 | 0.052 |
| 987.95 | 0.051 |
| 988.0 | 0.051 |
| 988.05 | 0.051 |
| 988.1 | 0.051 |
| 988.15 | 0.051 |
| 988.2 | 0.051 |
| 988.25 | 0.051 |
| 988.3 | 0.05 |
| 988.35 | 0.05 |
| 988.4 | 0.05 |
| 988.45 | 0.05 |
| 988.5 | 0.05 |
| 988.55 | 0.049 |
| 988.6 | 0.049 |
| 988.65 | 0.049 |
| 988.7 | 0.049 |
| 988.75 | 0.049 |
| 988.8 | 0.049 |
| 988.85 | 0.048 |
| 988.9 | 0.048 |
| 988.95 | 0.048 |
| 989.0 | 0.048 |
| 989.05 | 0.048 |
| 989.1 | 0.047 |
| 989.15 | 0.047 |
| 989.2 | 0.047 |
| 989.25 | 0.047 |
| 989.3 | 0.047 |
| 989.35 | 0.046 |
| 989.4 | 0.046 |
| 989.45 | 0.046 |
| 989.5 | 0.046 |
| 989.55 | 0.046 |
| 989.6 | 0.046 |
| 989.65 | 0.045 |
| 989.7 | 0.045 |
| 989.75 | 0.045 |
| 989.8 | 0.045 |
| 989.85 | 0.045 |
| 989.9 | 0.044 |
| 989.95 | 0.044 |
| 990.0 | 0.044 |
| 990.05 | 0.044 |
| 990.1 | 0.044 |
| 990.15 | 0.043 |
| 990.2 | 0.043 |
| 990.25 | 0.043 |
| 990.3 | 0.043 |
| 990.35 | 0.043 |
| 990.4 | 0.042 |
| 990.45 | 0.042 |
| 990.5 | 0.042 |
| 990.55 | 0.042 |
| 990.6 | 0.042 |
| 990.65 | 0.042 |
| 990.7 | 0.042 |
| 990.75 | 0.041 |
| 990.8 | 0.041 |
| 990.85 | 0.041 |
| 990.9 | 0.041 |
| 990.95 | 0.041 |
| 991.0 | 0.041 |
| 991.05 | 0.041 |
| 991.1 | 0.04 |
| 991.15 | 0.04 |
| 991.2 | 0.04 |
| 991.25 | 0.04 |
| 991.3 | 0.04 |
| 991.35 | 0.04 |
| 991.4 | 0.04 |
| 991.45 | 0.04 |
| 991.5 | 0.039 |
| 991.55 | 0.039 |
| 991.6 | 0.039 |
| 991.65 | 0.039 |
| 991.7 | 0.039 |
| 991.75 | 0.039 |
| 991.8 | 0.039 |
| 991.85 | 0.039 |
| 991.9 | 0.039 |
| 991.95 | 0.039 |
| 992.0 | 0.038 |
| 992.05 | 0.038 |
| 992.1 | 0.038 |
| 992.15 | 0.038 |
| 992.2 | 0.038 |
| 992.25 | 0.038 |
| 992.3 | 0.038 |
| 992.35 | 0.038 |
| 992.4 | 0.038 |
| 992.45 | 0.038 |
| 992.5 | 0.038 |
| 992.55 | 0.038 |
| 992.6 | 0.038 |
| 992.65 | 0.038 |
| 992.7 | 0.038 |
| 992.75 | 0.038 |
| 992.8 | 0.038 |
| 992.85 | 0.038 |
| 992.9 | 0.038 |
| 992.95 | 0.038 |
| 993.0 | 0.038 |
| 993.05 | 0.038 |
| 993.1 | 0.038 |
| 993.15 | 0.038 |
| 993.2 | 0.039 |
| 993.25 | 0.039 |
| 993.3 | 0.039 |
| 993.35 | 0.039 |
| 993.4 | 0.039 |
| 993.45 | 0.039 |
| 993.5 | 0.039 |
| 993.55 | 0.04 |
| 993.6 | 0.04 |
| 993.65 | 0.04 |
| 993.7 | 0.04 |
| 993.75 | 0.04 |
| 993.8 | 0.04 |
| 993.85 | 0.04 |
| 993.9 | 0.04 |
| 993.95 | 0.041 |
| 994.0 | 0.041 |
| 994.05 | 0.041 |
| 994.1 | 0.041 |
| 994.15 | 0.041 |
| 994.2 | 0.041 |
| 994.25 | 0.041 |
| 994.3 | 0.041 |
| 994.35 | 0.041 |
| 994.4 | 0.042 |
| 994.45 | 0.042 |
| 994.5 | 0.042 |
| 994.55 | 0.042 |
| 994.6 | 0.042 |
| 994.65 | 0.042 |
| 994.7 | 0.042 |
| 994.75 | 0.042 |
| 994.8 | 0.042 |
| 994.85 | 0.042 |
| 994.9 | 0.042 |
| 994.95 | 0.042 |
| 995.0 | 0.042 |
| 995.05 | 0.042 |
| 995.1 | 0.042 |
| 995.15 | 0.042 |
| 995.2 | 0.042 |
| 995.25 | 0.042 |
| 995.3 | 0.042 |
| 995.35 | 0.042 |
| 995.4 | 0.042 |
| 995.45 | 0.042 |
| 995.5 | 0.042 |
| 995.55 | 0.042 |
| 995.6 | 0.042 |
| 995.65 | 0.042 |
| 995.7 | 0.042 |
| 995.75 | 0.042 |
| 995.8 | 0.041 |
| 995.85 | 0.041 |
| 995.9 | 0.041 |
| 995.95 | 0.041 |
| 996.0 | 0.041 |
| 996.05 | 0.041 |
| 996.1 | 0.041 |
| 996.15 | 0.041 |
| 996.2 | 0.041 |
| 996.25 | 0.041 |
| 996.3 | 0.041 |
| 996.35 | 0.041 |
| 996.4 | 0.041 |
| 996.45 | 0.041 |
| 996.5 | 0.041 |
| 996.55 | 0.041 |
| 996.6 | 0.041 |
| 996.65 | 0.041 |
| 996.7 | 0.041 |
| 996.75 | 0.041 |
| 996.8 | 0.041 |
| 996.85 | 0.041 |
| 996.9 | 0.041 |
| 996.95 | 0.041 |
| 997.0 | 0.041 |
| 997.05 | 0.041 |
| 997.1 | 0.042 |
| 997.15 | 0.042 |
| 997.2 | 0.042 |
| 997.25 | 0.042 |
| 997.3 | 0.042 |
| 997.35 | 0.042 |
| 997.4 | 0.042 |
| 997.45 | 0.042 |
| 997.5 | 0.042 |
| 997.55 | 0.042 |
| 997.6 | 0.043 |
| 997.65 | 0.043 |
| 997.7 | 0.043 |
| 997.75 | 0.043 |
| 997.8 | 0.043 |
| 997.85 | 0.043 |
| 997.9 | 0.044 |
| 997.95 | 0.044 |
| 998.0 | 0.044 |
| 998.05 | 0.044 |
| 998.1 | 0.044 |
| 998.15 | 0.044 |
| 998.2 | 0.045 |
| 998.25 | 0.045 |
| 998.3 | 0.045 |
| 998.35 | 0.045 |
| 998.4 | 0.045 |
| 998.45 | 0.046 |
| 998.5 | 0.046 |
| 998.55 | 0.046 |
| 998.6 | 0.046 |
| 998.65 | 0.047 |
| 998.7 | 0.047 |
| 998.75 | 0.047 |
| 998.8 | 0.047 |
| 998.85 | 0.048 |
| 998.9 | 0.048 |
| 998.95 | 0.048 |
| 999.0 | 0.048 |
| 999.05 | 0.049 |
| 999.1 | 0.049 |
| 999.15 | 0.049 |
| 999.2 | 0.049 |
| 999.25 | 0.049 |
| 999.3 | 0.05 |
| 999.35 | 0.05 |
| 999.4 | 0.05 |
| 999.45 | 0.05 |
| 999.5 | 0.05 |
| 999.55 | 0.05 |
| 999.6 | 0.051 |
| 999.65 | 0.051 |
| 999.7 | 0.051 |
| 999.75 | 0.051 |
| 999.8 | 0.051 |
| 999.85 | 0.052 |
| 999.9 | 0.052 |
| 999.95 | 0.052 |
| 1000.0 | 0.052 |
| 1000.05 | 0.052 |
| 1000.1 | 0.052 |
| 1000.15 | 0.053 |
| 1000.2 | 0.053 |
| 1000.25 | 0.053 |
| 1000.3 | 0.053 |
| 1000.35 | 0.053 |
| 1000.4 | 0.053 |
| 1000.45 | 0.053 |
| 1000.5 | 0.053 |
| 1000.55 | 0.054 |
| 1000.6 | 0.054 |
| 1000.65 | 0.054 |
| 1000.7 | 0.054 |
| 1000.75 | 0.054 |
| 1000.8 | 0.054 |
| 1000.85 | 0.054 |
| 1000.9 | 0.054 |
| 1000.95 | 0.054 |
| 1001.0 | 0.054 |
| 1001.05 | 0.054 |
| 1001.1 | 0.054 |
| 1001.15 | 0.054 |
| 1001.2 | 0.054 |
| 1001.25 | 0.054 |
| 1001.3 | 0.054 |
| 1001.35 | 0.054 |
| 1001.4 | 0.054 |
| 1001.45 | 0.054 |
| 1001.5 | 0.054 |
| 1001.55 | 0.054 |
| 1001.6 | 0.054 |
| 1001.65 | 0.054 |
| 1001.7 | 0.054 |
| 1001.75 | 0.053 |
| 1001.8 | 0.053 |
| 1001.85 | 0.053 |
| 1001.9 | 0.053 |
| 1001.95 | 0.053 |
| 1002.0 | 0.052 |
| 1002.05 | 0.052 |
| 1002.1 | 0.052 |
| 1002.15 | 0.052 |
| 1002.2 | 0.052 |
| 1002.25 | 0.051 |
| 1002.3 | 0.051 |
| 1002.35 | 0.051 |
| 1002.4 | 0.051 |
| 1002.45 | 0.05 |
| 1002.5 | 0.05 |
| 1002.55 | 0.05 |
| 1002.6 | 0.05 |
| 1002.65 | 0.049 |
| 1002.7 | 0.049 |
| 1002.75 | 0.049 |
| 1002.8 | 0.049 |
| 1002.85 | 0.048 |
| 1002.9 | 0.048 |
| 1002.95 | 0.048 |
| 1003.0 | 0.048 |
| 1003.05 | 0.047 |
| 1003.1 | 0.047 |
| 1003.15 | 0.047 |
| 1003.2 | 0.046 |
| 1003.25 | 0.046 |
| 1003.3 | 0.046 |
| 1003.35 | 0.046 |
| 1003.4 | 0.045 |
| 1003.45 | 0.045 |
| 1003.5 | 0.045 |
| 1003.55 | 0.045 |
| 1003.6 | 0.045 |
| 1003.65 | 0.044 |
| 1003.7 | 0.044 |
| 1003.75 | 0.044 |
| 1003.8 | 0.044 |
| 1003.85 | 0.044 |
| 1003.9 | 0.044 |
| 1003.95 | 0.044 |
| 1004.0 | 0.044 |
| 1004.05 | 0.044 |
| 1004.1 | 0.044 |
| 1004.15 | 0.044 |
| 1004.2 | 0.044 |
| 1004.25 | 0.044 |
| 1004.3 | 0.044 |
| 1004.35 | 0.044 |
| 1004.4 | 0.044 |
| 1004.45 | 0.044 |
| 1004.5 | 0.044 |
| 1004.55 | 0.044 |
| 1004.6 | 0.044 |
| 1004.65 | 0.045 |
| 1004.7 | 0.045 |
| 1004.75 | 0.045 |
| 1004.8 | 0.045 |
| 1004.85 | 0.045 |
| 1004.9 | 0.045 |
| 1004.95 | 0.045 |
| 1005.0 | 0.045 |
| 1005.05 | 0.046 |
| 1005.1 | 0.046 |
| 1005.15 | 0.046 |
| 1005.2 | 0.046 |
| 1005.25 | 0.046 |
| 1005.3 | 0.047 |
| 1005.35 | 0.047 |
| 1005.4 | 0.047 |
| 1005.45 | 0.047 |
| 1005.5 | 0.047 |
| 1005.55 | 0.047 |
| 1005.6 | 0.048 |
| 1005.65 | 0.048 |
| 1005.7 | 0.048 |
| 1005.75 | 0.048 |
| 1005.8 | 0.048 |
| 1005.85 | 0.048 |
| 1005.9 | 0.048 |
| 1005.95 | 0.048 |
| 1006.0 | 0.049 |
| 1006.05 | 0.049 |
| 1006.1 | 0.049 |
| 1006.15 | 0.049 |
| 1006.2 | 0.049 |
| 1006.25 | 0.049 |
| 1006.3 | 0.049 |
| 1006.35 | 0.049 |
| 1006.4 | 0.049 |
| 1006.45 | 0.049 |
| 1006.5 | 0.049 |
| 1006.55 | 0.049 |
| 1006.6 | 0.049 |
| 1006.65 | 0.049 |
| 1006.7 | 0.049 |
| 1006.75 | 0.049 |
| 1006.8 | 0.049 |
| 1006.85 | 0.049 |
| 1006.9 | 0.049 |
| 1006.95 | 0.049 |
| 1007.0 | 0.049 |
| 1007.05 | 0.049 |
| 1007.1 | 0.049 |
| 1007.15 | 0.049 |
| 1007.2 | 0.049 |
| 1007.25 | 0.049 |
| 1007.3 | 0.049 |
| 1007.35 | 0.049 |
| 1007.4 | 0.049 |
| 1007.45 | 0.049 |
| 1007.5 | 0.049 |
| 1007.55 | 0.049 |
| 1007.6 | 0.049 |
| 1007.65 | 0.049 |
| 1007.7 | 0.049 |
| 1007.75 | 0.049 |
| 1007.8 | 0.049 |
| 1007.85 | 0.049 |
| 1007.9 | 0.049 |
| 1007.95 | 0.049 |
| 1008.0 | 0.049 |
| 1008.05 | 0.049 |
| 1008.1 | 0.048 |
| 1008.15 | 0.048 |
| 1008.2 | 0.048 |
| 1008.25 | 0.048 |
| 1008.3 | 0.048 |
| 1008.35 | 0.048 |
| 1008.4 | 0.048 |
| 1008.45 | 0.048 |
| 1008.5 | 0.047 |
| 1008.55 | 0.047 |
| 1008.6 | 0.047 |
| 1008.65 | 0.047 |
| 1008.7 | 0.047 |
| 1008.75 | 0.047 |
| 1008.8 | 0.046 |
| 1008.85 | 0.046 |
| 1008.9 | 0.046 |
| 1008.95 | 0.046 |
| 1009.0 | 0.045 |
| 1009.05 | 0.045 |
| 1009.1 | 0.045 |
| 1009.15 | 0.045 |
| 1009.2 | 0.044 |
| 1009.25 | 0.044 |
| 1009.3 | 0.044 |
| 1009.35 | 0.043 |
| 1009.4 | 0.043 |
| 1009.45 | 0.043 |
| 1009.5 | 0.042 |
| 1009.55 | 0.042 |
| 1009.6 | 0.042 |
| 1009.65 | 0.041 |
| 1009.7 | 0.041 |
| 1009.75 | 0.041 |
| 1009.8 | 0.04 |
| 1009.85 | 0.04 |
| 1009.9 | 0.039 |
| 1009.95 | 0.039 |
| 1010.0 | 0.039 |
| 1010.05 | 0.038 |
| 1010.1 | 0.038 |
| 1010.15 | 0.038 |
| 1010.2 | 0.037 |
| 1010.25 | 0.037 |
| 1010.3 | 0.037 |
| 1010.35 | 0.036 |
| 1010.4 | 0.036 |
| 1010.45 | 0.036 |
| 1010.5 | 0.035 |
| 1010.55 | 0.035 |
| 1010.6 | 0.035 |
| 1010.65 | 0.035 |
| 1010.7 | 0.034 |
| 1010.75 | 0.034 |
| 1010.8 | 0.034 |
| 1010.85 | 0.034 |
| 1010.9 | 0.033 |
| 1010.95 | 0.033 |
| 1011.0 | 0.033 |
| 1011.05 | 0.033 |
| 1011.1 | 0.032 |
| 1011.15 | 0.032 |
| 1011.2 | 0.032 |
| 1011.25 | 0.032 |
| 1011.3 | 0.031 |
| 1011.35 | 0.031 |
| 1011.4 | 0.031 |
| 1011.45 | 0.031 |
| 1011.5 | 0.031 |
| 1011.55 | 0.031 |
| 1011.6 | 0.03 |
| 1011.65 | 0.03 |
| 1011.7 | 0.03 |
| 1011.75 | 0.03 |
| 1011.8 | 0.03 |
| 1011.85 | 0.03 |
| 1011.9 | 0.03 |
| 1011.95 | 0.03 |
| 1012.0 | 0.03 |
| 1012.05 | 0.03 |
| 1012.1 | 0.03 |
| 1012.15 | 0.029 |
| 1012.2 | 0.029 |
| 1012.25 | 0.029 |
| 1012.3 | 0.029 |
| 1012.35 | 0.029 |
| 1012.4 | 0.029 |
| 1012.45 | 0.029 |
| 1012.5 | 0.029 |
| 1012.55 | 0.029 |
| 1012.6 | 0.029 |
| 1012.65 | 0.029 |
| 1012.7 | 0.029 |
| 1012.75 | 0.029 |
| 1012.8 | 0.029 |
| 1012.85 | 0.028 |
| 1012.9 | 0.028 |
| 1012.95 | 0.028 |
| 1013.0 | 0.028 |
| 1013.05 | 0.028 |
| 1013.1 | 0.028 |
| 1013.15 | 0.028 |
| 1013.2 | 0.028 |
| 1013.25 | 0.028 |
| 1013.3 | 0.028 |
| 1013.35 | 0.028 |
| 1013.4 | 0.028 |
| 1013.45 | 0.028 |
| 1013.5 | 0.028 |
| 1013.55 | 0.028 |
| 1013.6 | 0.028 |
| 1013.65 | 0.027 |
| 1013.7 | 0.027 |
| 1013.75 | 0.027 |
| 1013.8 | 0.027 |
| 1013.85 | 0.027 |
| 1013.9 | 0.027 |
| 1013.95 | 0.027 |
| 1014.0 | 0.027 |
| 1014.05 | 0.027 |
| 1014.1 | 0.027 |
| 1014.15 | 0.026 |
| 1014.2 | 0.026 |
| 1014.25 | 0.026 |
| 1014.3 | 0.026 |
| 1014.35 | 0.026 |
| 1014.4 | 0.026 |
| 1014.45 | 0.026 |
| 1014.5 | 0.026 |
| 1014.55 | 0.026 |
| 1014.6 | 0.025 |
| 1014.65 | 0.025 |
| 1014.7 | 0.025 |
| 1014.75 | 0.025 |
| 1014.8 | 0.025 |
| 1014.85 | 0.025 |
| 1014.9 | 0.025 |
| 1014.95 | 0.025 |
| 1015.0 | 0.024 |
| 1015.05 | 0.024 |
| 1015.1 | 0.024 |
| 1015.15 | 0.024 |
| 1015.2 | 0.024 |
| 1015.25 | 0.024 |
| 1015.3 | 0.024 |
| 1015.35 | 0.023 |
| 1015.4 | 0.023 |
| 1015.45 | 0.023 |
| 1015.5 | 0.023 |
| 1015.55 | 0.023 |
| 1015.6 | 0.023 |
| 1015.65 | 0.023 |
| 1015.7 | 0.023 |
| 1015.75 | 0.022 |
| 1015.8 | 0.022 |
| 1015.85 | 0.022 |
| 1015.9 | 0.022 |
| 1015.95 | 0.022 |
| 1016.0 | 0.022 |
| 1016.05 | 0.022 |
| 1016.1 | 0.022 |
| 1016.15 | 0.022 |
| 1016.2 | 0.022 |
| 1016.25 | 0.022 |
| 1016.3 | 0.022 |
| 1016.35 | 0.021 |
| 1016.4 | 0.021 |
| 1016.45 | 0.021 |
| 1016.5 | 0.021 |
| 1016.55 | 0.021 |
| 1016.6 | 0.021 |
| 1016.65 | 0.021 |
| 1016.7 | 0.021 |
| 1016.75 | 0.021 |
| 1016.8 | 0.021 |
| 1016.85 | 0.021 |
| 1016.9 | 0.021 |
| 1016.95 | 0.021 |
| 1017.0 | 0.021 |
| 1017.05 | 0.021 |
| 1017.1 | 0.021 |
| 1017.15 | 0.02 |
| 1017.2 | 0.02 |
| 1017.25 | 0.02 |
| 1017.3 | 0.02 |
| 1017.35 | 0.02 |
| 1017.4 | 0.02 |
| 1017.45 | 0.02 |
| 1017.5 | 0.02 |
| 1017.55 | 0.02 |
| 1017.6 | 0.02 |
| 1017.65 | 0.02 |
| 1017.7 | 0.02 |
| 1017.75 | 0.02 |
| 1017.8 | 0.02 |
| 1017.85 | 0.02 |
| 1017.9 | 0.02 |
| 1017.95 | 0.02 |
| 1018.0 | 0.02 |
| 1018.05 | 0.02 |
| 1018.1 | 0.02 |
| 1018.15 | 0.02 |
| 1018.2 | 0.02 |
| 1018.25 | 0.02 |
| 1018.3 | 0.02 |
| 1018.35 | 0.021 |
| 1018.4 | 0.021 |
| 1018.45 | 0.021 |
| 1018.5 | 0.021 |
| 1018.55 | 0.021 |
| 1018.6 | 0.021 |
| 1018.65 | 0.021 |
| 1018.7 | 0.021 |
| 1018.75 | 0.021 |
| 1018.8 | 0.021 |
| 1018.85 | 0.021 |
| 1018.9 | 0.021 |
| 1018.95 | 0.021 |
| 1019.0 | 0.021 |
| 1019.05 | 0.022 |
| 1019.1 | 0.022 |
| 1019.15 | 0.022 |
| 1019.2 | 0.022 |
| 1019.25 | 0.022 |
| 1019.3 | 0.022 |
| 1019.35 | 0.022 |
| 1019.4 | 0.022 |
| 1019.45 | 0.023 |
| 1019.5 | 0.023 |
| 1019.55 | 0.023 |
| 1019.6 | 0.023 |
| 1019.65 | 0.023 |
| 1019.7 | 0.023 |
| 1019.75 | 0.023 |
| 1019.8 | 0.023 |
| 1019.85 | 0.024 |
| 1019.9 | 0.024 |
| 1019.95 | 0.024 |
| 1020.0 | 0.024 |
| 1020.05 | 0.024 |
| 1020.1 | 0.024 |
| 1020.15 | 0.025 |
| 1020.2 | 0.025 |
| 1020.25 | 0.025 |
| 1020.3 | 0.025 |
| 1020.35 | 0.025 |
| 1020.4 | 0.025 |
| 1020.45 | 0.025 |
| 1020.5 | 0.026 |
| 1020.55 | 0.026 |
| 1020.6 | 0.026 |
| 1020.65 | 0.026 |
| 1020.7 | 0.026 |
| 1020.75 | 0.026 |
| 1020.8 | 0.027 |
| 1020.85 | 0.027 |
| 1020.9 | 0.027 |
| 1020.95 | 0.027 |
| 1021.0 | 0.027 |
| 1021.05 | 0.027 |
| 1021.1 | 0.027 |
| 1021.15 | 0.028 |
| 1021.2 | 0.028 |
| 1021.25 | 0.028 |
| 1021.3 | 0.028 |
| 1021.35 | 0.028 |
| 1021.4 | 0.028 |
| 1021.45 | 0.029 |
| 1021.5 | 0.029 |
| 1021.55 | 0.029 |
| 1021.6 | 0.029 |
| 1021.65 | 0.029 |
| 1021.7 | 0.03 |
| 1021.75 | 0.03 |
| 1021.8 | 0.03 |
| 1021.85 | 0.03 |
| 1021.9 | 0.031 |
| 1021.95 | 0.031 |
| 1022.0 | 0.031 |
| 1022.05 | 0.031 |
| 1022.1 | 0.032 |
| 1022.15 | 0.032 |
| 1022.2 | 0.032 |
| 1022.25 | 0.033 |
| 1022.3 | 0.033 |
| 1022.35 | 0.033 |
| 1022.4 | 0.034 |
| 1022.45 | 0.034 |
| 1022.5 | 0.035 |
| 1022.55 | 0.035 |
| 1022.6 | 0.036 |
| 1022.65 | 0.036 |
| 1022.7 | 0.037 |
| 1022.75 | 0.037 |
| 1022.8 | 0.038 |
| 1022.85 | 0.038 |
| 1022.9 | 0.039 |
| 1022.95 | 0.039 |
| 1023.0 | 0.04 |
| 1023.05 | 0.04 |
| 1023.1 | 0.041 |
| 1023.15 | 0.041 |
| 1023.2 | 0.042 |
| 1023.25 | 0.043 |
| 1023.3 | 0.043 |
| 1023.35 | 0.044 |
| 1023.4 | 0.044 |
| 1023.45 | 0.045 |
| 1023.5 | 0.046 |
| 1023.55 | 0.046 |
| 1023.6 | 0.047 |
| 1023.65 | 0.048 |
| 1023.7 | 0.048 |
| 1023.75 | 0.049 |
| 1023.8 | 0.049 |
| 1023.85 | 0.05 |
| 1023.9 | 0.05 |
| 1023.95 | 0.051 |
| 1024.0 | 0.052 |
| 1024.05 | 0.052 |
| 1024.1 | 0.053 |
| 1024.15 | 0.053 |
| 1024.2 | 0.053 |
| 1024.25 | 0.054 |
| 1024.3 | 0.054 |
| 1024.35 | 0.055 |
| 1024.4 | 0.055 |
| 1024.45 | 0.055 |
| 1024.5 | 0.056 |
| 1024.55 | 0.056 |
| 1024.6 | 0.056 |
| 1024.65 | 0.057 |
| 1024.7 | 0.057 |
| 1024.75 | 0.057 |
| 1024.8 | 0.057 |
| 1024.85 | 0.058 |
| 1024.9 | 0.058 |
| 1024.95 | 0.058 |
| 1025.0 | 0.059 |
| 1025.05 | 0.059 |
| 1025.1 | 0.059 |
| 1025.15 | 0.059 |
| 1025.2 | 0.06 |
| 1025.25 | 0.06 |
| 1025.3 | 0.06 |
| 1025.35 | 0.06 |
| 1025.4 | 0.061 |
| 1025.45 | 0.061 |
| 1025.5 | 0.061 |
| 1025.55 | 0.061 |
| 1025.6 | 0.062 |
| 1025.65 | 0.062 |
| 1025.7 | 0.062 |
| 1025.75 | 0.063 |
| 1025.8 | 0.063 |
| 1025.85 | 0.063 |
| 1025.9 | 0.063 |
| 1025.95 | 0.064 |
| 1026.0 | 0.064 |
| 1026.05 | 0.064 |
| 1026.1 | 0.065 |
| 1026.15 | 0.065 |
| 1026.2 | 0.065 |
| 1026.25 | 0.065 |
| 1026.3 | 0.066 |
| 1026.35 | 0.066 |
| 1026.4 | 0.066 |
| 1026.45 | 0.066 |
| 1026.5 | 0.066 |
| 1026.55 | 0.067 |
| 1026.6 | 0.067 |
| 1026.65 | 0.067 |
| 1026.7 | 0.067 |
| 1026.75 | 0.067 |
| 1026.8 | 0.067 |
| 1026.85 | 0.067 |
| 1026.9 | 0.067 |
| 1026.95 | 0.067 |
| 1027.0 | 0.067 |
| 1027.05 | 0.067 |
| 1027.1 | 0.067 |
| 1027.15 | 0.067 |
| 1027.2 | 0.067 |
| 1027.25 | 0.066 |
| 1027.3 | 0.066 |
| 1027.35 | 0.066 |
| 1027.4 | 0.066 |
| 1027.45 | 0.066 |
| 1027.5 | 0.065 |
| 1027.55 | 0.065 |
| 1027.6 | 0.065 |
| 1027.65 | 0.065 |
| 1027.7 | 0.064 |
| 1027.75 | 0.064 |
| 1027.8 | 0.064 |
| 1027.85 | 0.064 |
| 1027.9 | 0.064 |
| 1027.95 | 0.063 |
| 1028.0 | 0.063 |
| 1028.05 | 0.063 |
| 1028.1 | 0.063 |
| 1028.15 | 0.063 |
| 1028.2 | 0.063 |
| 1028.25 | 0.063 |
| 1028.3 | 0.063 |
| 1028.35 | 0.063 |
| 1028.4 | 0.063 |
| 1028.45 | 0.063 |
| 1028.5 | 0.063 |
| 1028.55 | 0.063 |
| 1028.6 | 0.063 |
| 1028.65 | 0.063 |
| 1028.7 | 0.063 |
| 1028.75 | 0.064 |
| 1028.8 | 0.064 |
| 1028.85 | 0.064 |
| 1028.9 | 0.064 |
| 1028.95 | 0.065 |
| 1029.0 | 0.065 |
| 1029.05 | 0.065 |
| 1029.1 | 0.066 |
| 1029.15 | 0.066 |
| 1029.2 | 0.067 |
| 1029.25 | 0.067 |
| 1029.3 | 0.068 |
| 1029.35 | 0.069 |
| 1029.4 | 0.069 |
| 1029.45 | 0.07 |
| 1029.5 | 0.071 |
| 1029.55 | 0.072 |
| 1029.6 | 0.073 |
| 1029.65 | 0.074 |
| 1029.7 | 0.075 |
| 1029.75 | 0.076 |
| 1029.8 | 0.077 |
| 1029.85 | 0.078 |
| 1029.9 | 0.079 |
| 1029.95 | 0.08 |
| 1030.0 | 0.081 |
| 1030.05 | 0.083 |
| 1030.1 | 0.084 |
| 1030.15 | 0.085 |
| 1030.2 | 0.086 |
| 1030.25 | 0.087 |
| 1030.3 | 0.088 |
| 1030.35 | 0.089 |
| 1030.4 | 0.091 |
| 1030.45 | 0.092 |
| 1030.5 | 0.093 |
| 1030.55 | 0.094 |
| 1030.6 | 0.095 |
| 1030.65 | 0.096 |
| 1030.7 | 0.097 |
| 1030.75 | 0.098 |
| 1030.8 | 0.099 |
| 1030.85 | 0.1 |
| 1030.9 | 0.101 |
| 1030.95 | 0.102 |
| 1031.0 | 0.103 |
| 1031.05 | 0.103 |
| 1031.1 | 0.104 |
| 1031.15 | 0.105 |
| 1031.2 | 0.105 |
| 1031.25 | 0.106 |
| 1031.3 | 0.106 |
| 1031.35 | 0.107 |
| 1031.4 | 0.107 |
| 1031.45 | 0.107 |
| 1031.5 | 0.107 |
| 1031.55 | 0.106 |
| 1031.6 | 0.106 |
| 1031.65 | 0.106 |
| 1031.7 | 0.105 |
| 1031.75 | 0.104 |
| 1031.8 | 0.104 |
| 1031.85 | 0.103 |
| 1031.9 | 0.102 |
| 1031.95 | 0.101 |
| 1032.0 | 0.099 |
| 1032.05 | 0.098 |
| 1032.1 | 0.097 |
| 1032.15 | 0.095 |
| 1032.2 | 0.094 |
| 1032.25 | 0.093 |
| 1032.3 | 0.091 |
| 1032.35 | 0.089 |
| 1032.4 | 0.087 |
| 1032.45 | 0.085 |
| 1032.5 | 0.084 |
| 1032.55 | 0.082 |
| 1032.6 | 0.08 |
| 1032.65 | 0.079 |
| 1032.7 | 0.077 |
| 1032.75 | 0.075 |
| 1032.8 | 0.073 |
| 1032.85 | 0.072 |
| 1032.9 | 0.071 |
| 1032.95 | 0.069 |
| 1033.0 | 0.068 |
| 1033.05 | 0.066 |
| 1033.1 | 0.065 |
| 1033.15 | 0.063 |
| 1033.2 | 0.062 |
| 1033.25 | 0.06 |
| 1033.3 | 0.059 |
| 1033.35 | 0.058 |
| 1033.4 | 0.056 |
| 1033.45 | 0.055 |
| 1033.5 | 0.053 |
| 1033.55 | 0.052 |
| 1033.6 | 0.05 |
| 1033.65 | 0.049 |
| 1033.7 | 0.048 |
| 1033.75 | 0.047 |
| 1033.8 | 0.045 |
| 1033.85 | 0.044 |
| 1033.9 | 0.043 |
| 1033.95 | 0.042 |
| 1034.0 | 0.041 |
| 1034.05 | 0.04 |
| 1034.1 | 0.039 |
| 1034.15 | 0.038 |
| 1034.2 | 0.037 |
| 1034.25 | 0.036 |
| 1034.3 | 0.035 |
| 1034.35 | 0.034 |
| 1034.4 | 0.033 |
| 1034.45 | 0.033 |
| 1034.5 | 0.032 |
| 1034.55 | 0.031 |
| 1034.6 | 0.031 |
| 1034.65 | 0.03 |
| 1034.7 | 0.029 |
| 1034.75 | 0.029 |
| 1034.8 | 0.028 |
| 1034.85 | 0.028 |
| 1034.9 | 0.027 |
| 1034.95 | 0.027 |
| 1035.0 | 0.026 |
| 1035.05 | 0.025 |
| 1035.1 | 0.025 |
| 1035.15 | 0.024 |
| 1035.2 | 0.024 |
| 1035.25 | 0.023 |
| 1035.3 | 0.023 |
| 1035.35 | 0.022 |
| 1035.4 | 0.022 |
| 1035.45 | 0.021 |
| 1035.5 | 0.021 |
| 1035.55 | 0.02 |
| 1035.6 | 0.02 |
| 1035.65 | 0.02 |
| 1035.7 | 0.019 |
| 1035.75 | 0.019 |
| 1035.8 | 0.018 |
| 1035.85 | 0.018 |
| 1035.9 | 0.018 |
| 1035.95 | 0.017 |
| 1036.0 | 0.017 |
| 1036.05 | 0.017 |
| 1036.1 | 0.016 |
| 1036.15 | 0.016 |
| 1036.2 | 0.016 |
| 1036.25 | 0.016 |
| 1036.3 | 0.015 |
| 1036.35 | 0.015 |
| 1036.4 | 0.015 |
| 1036.45 | 0.015 |
| 1036.5 | 0.014 |
| 1036.55 | 0.014 |
| 1036.6 | 0.014 |
| 1036.65 | 0.014 |
| 1036.7 | 0.014 |
| 1036.75 | 0.013 |
| 1036.8 | 0.013 |
| 1036.85 | 0.013 |
| 1036.9 | 0.013 |
| 1036.95 | 0.013 |
| 1037.0 | 0.013 |
| 1037.05 | 0.012 |
| 1037.1 | 0.012 |
| 1037.15 | 0.012 |
| 1037.2 | 0.012 |
| 1037.25 | 0.012 |
| 1037.3 | 0.012 |
| 1037.35 | 0.011 |
| 1037.4 | 0.011 |
| 1037.45 | 0.011 |
| 1037.5 | 0.011 |
| 1037.55 | 0.011 |
| 1037.6 | 0.011 |
| 1037.65 | 0.011 |
| 1037.7 | 0.01 |
| 1037.75 | 0.01 |
| 1037.8 | 0.01 |
| 1037.85 | 0.01 |
| 1037.9 | 0.01 |
| 1037.95 | 0.01 |
| 1038.0 | 0.01 |
| 1038.05 | 0.009 |
| 1038.1 | 0.009 |
| 1038.15 | 0.009 |
| 1038.2 | 0.009 |
| 1038.25 | 0.009 |
| 1038.3 | 0.009 |
| 1038.35 | 0.009 |
| 1038.4 | 0.009 |
| 1038.45 | 0.009 |
| 1038.5 | 0.009 |
| 1038.55 | 0.009 |
| 1038.6 | 0.009 |
| 1038.65 | 0.008 |
| 1038.7 | 0.008 |
| 1038.75 | 0.008 |
| 1038.8 | 0.008 |
| 1038.85 | 0.008 |
| 1038.9 | 0.008 |
| 1038.95 | 0.008 |
| 1039.0 | 0.008 |
| 1039.05 | 0.008 |
| 1039.1 | 0.008 |
| 1039.15 | 0.008 |
| 1039.2 | 0.008 |
| 1039.25 | 0.007 |
| 1039.3 | 0.007 |
| 1039.35 | 0.007 |
| 1039.4 | 0.007 |
| 1039.45 | 0.007 |
| 1039.5 | 0.007 |
| 1039.55 | 0.007 |
| 1039.6 | 0.007 |
| 1039.65 | 0.007 |
| 1039.7 | 0.007 |
| 1039.75 | 0.007 |
| 1039.8 | 0.007 |
| 1039.85 | 0.007 |
| 1039.9 | 0.007 |
| 1039.95 | 0.007 |
| 1040.0 | 0.007 |
| 1040.05 | 0.007 |
| 1040.1 | 0.007 |
| 1040.15 | 0.006 |
| 1040.2 | 0.006 |
| 1040.25 | 0.006 |
| 1040.3 | 0.006 |
| 1040.35 | 0.006 |
| 1040.4 | 0.006 |
| 1040.45 | 0.006 |
| 1040.5 | 0.006 |
| 1040.55 | 0.006 |
| 1040.6 | 0.006 |
| 1040.65 | 0.006 |
| 1040.7 | 0.006 |
| 1040.75 | 0.006 |
| 1040.8 | 0.006 |
| 1040.85 | 0.006 |
| 1040.9 | 0.006 |
| 1040.95 | 0.006 |
| 1041.0 | 0.006 |
| 1041.05 | 0.006 |
| 1041.1 | 0.006 |
| 1041.15 | 0.006 |
| 1041.2 | 0.006 |
| 1041.25 | 0.006 |
| 1041.3 | 0.006 |
| 1041.35 | 0.005 |
| 1041.4 | 0.005 |
| 1041.45 | 0.005 |
| 1041.5 | 0.005 |
| 1041.55 | 0.005 |
| 1041.6 | 0.005 |
| 1041.65 | 0.005 |
| 1041.7 | 0.005 |
| 1041.75 | 0.005 |
| 1041.8 | 0.005 |
| 1041.85 | 0.005 |
| 1041.9 | 0.005 |
| 1041.95 | 0.005 |
| 1042.0 | 0.005 |
| 1042.05 | 0.005 |
| 1042.1 | 0.004 |
| 1042.15 | 0.004 |
| 1042.2 | 0.004 |
| 1042.25 | 0.004 |
| 1042.3 | 0.004 |
| 1042.35 | 0.004 |
| 1042.4 | 0.004 |
| 1042.45 | 0.004 |
| 1042.5 | 0.004 |
| 1042.55 | 0.004 |
| 1042.6 | 0.004 |
| 1042.65 | 0.004 |
| 1042.7 | 0.004 |
| 1042.75 | 0.004 |
| 1042.8 | 0.004 |
| 1042.85 | 0.004 |
| 1042.9 | 0.004 |
| 1042.95 | 0.004 |
| 1043.0 | 0.004 |
| 1043.05 | 0.004 |
| 1043.1 | 0.004 |
| 1043.15 | 0.004 |
| 1043.2 | 0.004 |
| 1043.25 | 0.004 |
| 1043.3 | 0.004 |
| 1043.35 | 0.003 |
| 1043.4 | 0.003 |
| 1043.45 | 0.003 |
| 1043.5 | 0.003 |
| 1043.55 | 0.003 |
| 1043.6 | 0.003 |
| 1043.65 | 0.003 |
| 1043.7 | 0.003 |
| 1043.75 | 0.003 |
| 1043.8 | 0.003 |
| 1043.85 | 0.003 |
| 1043.9 | 0.003 |
| 1043.95 | 0.003 |
| 1044.0 | 0.003 |
| 1044.05 | 0.003 |
| 1044.1 | 0.003 |
| 1044.15 | 0.003 |
| 1044.2 | 0.003 |
| 1044.25 | 0.003 |
| 1044.3 | 0.003 |
| 1044.35 | 0.003 |
| 1044.4 | 0.003 |
| 1044.45 | 0.003 |
| 1044.5 | 0.003 |
| 1044.55 | 0.003 |
| 1044.6 | 0.003 |
| 1044.65 | 0.003 |
| 1044.7 | 0.003 |
| 1044.75 | 0.003 |
| 1044.8 | 0.003 |
| 1044.85 | 0.003 |
| 1044.9 | 0.003 |
| 1044.95 | 0.003 |
| 1045.0 | 0.003 |
| 1045.05 | 0.003 |
| 1045.1 | 0.003 |
| 1045.15 | 0.003 |
| 1045.2 | 0.003 |
| 1045.25 | 0.003 |
| 1045.3 | 0.003 |
| 1045.35 | 0.003 |
| 1045.4 | 0.003 |
| 1045.45 | 0.003 |
| 1045.5 | 0.003 |
| 1045.55 | 0.003 |
| 1045.6 | 0.003 |
| 1045.65 | 0.003 |
| 1045.7 | 0.003 |
| 1045.75 | 0.003 |
| 1045.8 | 0.003 |
| 1045.85 | 0.003 |
| 1045.9 | 0.003 |
| 1045.95 | 0.003 |
| 1046.0 | 0.003 |
| 1046.05 | 0.003 |
| 1046.1 | 0.003 |
| 1046.15 | 0.003 |
| 1046.2 | 0.003 |
| 1046.25 | 0.003 |
| 1046.3 | 0.003 |
| 1046.35 | 0.003 |
| 1046.4 | 0.003 |
| 1046.45 | 0.003 |
| 1046.5 | 0.003 |
| 1046.55 | 0.003 |
| 1046.6 | 0.003 |
| 1046.65 | 0.003 |
| 1046.7 | 0.003 |
| 1046.75 | 0.003 |
| 1046.8 | 0.003 |
| 1046.85 | 0.003 |
| 1046.9 | 0.003 |
| 1046.95 | 0.003 |
| 1047.0 | 0.003 |
| 1047.05 | 0.003 |
| 1047.1 | 0.003 |
| 1047.15 | 0.003 |
| 1047.2 | 0.003 |
| 1047.25 | 0.003 |
| 1047.3 | 0.003 |
| 1047.35 | 0.003 |
| 1047.4 | 0.003 |
| 1047.45 | 0.003 |
| 1047.5 | 0.003 |
| 1047.55 | 0.003 |
| 1047.6 | 0.003 |
| 1047.65 | 0.003 |
| 1047.7 | 0.003 |
| 1047.75 | 0.003 |
| 1047.8 | 0.003 |
| 1047.85 | 0.003 |
| 1047.9 | 0.003 |
| 1047.95 | 0.003 |
| 1048.0 | 0.003 |
| 1048.05 | 0.003 |
| 1048.1 | 0.003 |
| 1048.15 | 0.003 |
| 1048.2 | 0.003 |
| 1048.25 | 0.003 |
| 1048.3 | 0.003 |
| 1048.35 | 0.003 |
| 1048.4 | 0.003 |
| 1048.45 | 0.004 |
| 1048.5 | 0.004 |
| 1048.55 | 0.004 |
| 1048.6 | 0.004 |
| 1048.65 | 0.004 |
| 1048.7 | 0.004 |
| 1048.75 | 0.004 |
| 1048.8 | 0.004 |
| 1048.85 | 0.004 |
| 1048.9 | 0.004 |
| 1048.95 | 0.004 |
| 1049.0 | 0.004 |
| 1049.05 | 0.004 |
| 1049.1 | 0.004 |
| 1049.15 | 0.004 |
| 1049.2 | 0.004 |
| 1049.25 | 0.004 |
| 1049.3 | 0.004 |
| 1049.35 | 0.004 |
| 1049.4 | 0.004 |
| 1049.45 | 0.004 |
| 1049.5 | 0.004 |
| 1049.55 | 0.004 |
| 1049.6 | 0.004 |
| 1049.65 | 0.004 |
| 1049.7 | 0.004 |
| 1049.75 | 0.004 |
| 1049.8 | 0.004 |
| 1049.85 | 0.004 |
| 1049.9 | 0.004 |
| 1049.95 | 0.004 |
| 1050.0 | 0.004 |
| 1050.05 | 0.004 |
| 1050.1 | 0.004 |
| 1050.15 | 0.004 |
| 1050.2 | 0.004 |
| 1050.25 | 0.004 |
| 1050.3 | 0.004 |
| 1050.35 | 0.004 |
| 1050.4 | 0.004 |
| 1050.45 | 0.004 |
| 1050.5 | 0.004 |
| 1050.55 | 0.004 |
| 1050.6 | 0.004 |
| 1050.65 | 0.004 |
| 1050.7 | 0.004 |
| 1050.75 | 0.004 |
| 1050.8 | 0.004 |
| 1050.85 | 0.004 |
| 1050.9 | 0.004 |
| 1050.95 | 0.004 |
| 1051.0 | 0.004 |
| 1051.05 | 0.004 |
| 1051.1 | 0.004 |
| 1051.15 | 0.004 |
| 1051.2 | 0.004 |
| 1051.25 | 0.003 |
| 1051.3 | 0.003 |
| 1051.35 | 0.003 |
| 1051.4 | 0.003 |
| 1051.45 | 0.003 |
| 1051.5 | 0.003 |
| 1051.55 | 0.003 |
| 1051.6 | 0.003 |
| 1051.65 | 0.003 |
| 1051.7 | 0.003 |
| 1051.75 | 0.003 |
| 1051.8 | 0.003 |
| 1051.85 | 0.003 |
| 1051.9 | 0.003 |
| 1051.95 | 0.003 |
| 1052.0 | 0.003 |
| 1052.05 | 0.003 |
| 1052.1 | 0.003 |
| 1052.15 | 0.003 |
| 1052.2 | 0.003 |
| 1052.25 | 0.003 |
| 1052.3 | 0.003 |
| 1052.35 | 0.003 |
| 1052.4 | 0.003 |
| 1052.45 | 0.002 |
| 1052.5 | 0.002 |
| 1052.55 | 0.002 |
| 1052.6 | 0.002 |
| 1052.65 | 0.002 |
| 1052.7 | 0.002 |
| 1052.75 | 0.002 |
| 1052.8 | 0.002 |
| 1052.85 | 0.002 |
| 1052.9 | 0.002 |
| 1052.95 | 0.002 |
| 1053.0 | 0.002 |
| 1053.05 | 0.002 |
| 1053.1 | 0.002 |
| 1053.15 | 0.002 |
| 1053.2 | 0.002 |
| 1053.25 | 0.002 |
| 1053.3 | 0.002 |
| 1053.35 | 0.002 |
| 1053.4 | 0.002 |
| 1053.45 | 0.002 |
| 1053.5 | 0.001 |
| 1053.55 | 0.001 |
| 1053.6 | 0.001 |
| 1053.65 | 0.001 |
| 1053.7 | 0.001 |
| 1053.75 | 0.001 |
| 1053.8 | 0.001 |
| 1053.85 | 0.001 |
| 1053.9 | 0.001 |
| 1053.95 | 0.001 |
| 1054.0 | 0.001 |
| 1054.05 | 0.001 |
| 1054.1 | 0.001 |
| 1054.15 | 0.001 |
| 1054.2 | 0.001 |
| 1054.25 | 0.001 |
| 1054.3 | 0.001 |
| 1054.35 | 0.001 |
| 1054.4 | 0.001 |
| 1054.45 | 0.001 |
| 1054.5 | 0.001 |
| 1054.55 | 0.001 |
| 1054.6 | 0.001 |
| 1054.65 | 0 |
| 1054.7 | 0 |
| 1054.75 | 0 |
| 1054.8 | 0 |
| 1054.85 | 0 |
| 1054.9 | 0 |
| 1054.95 | 0 |
| 1055.0 | 0 |
| 1055.05 | 0 |
| 1055.1 | 0 |
| 1055.15 | 0 |
| 1055.2 | 0 |
| 1055.25 | 0 |
| 1055.3 | 0 |
| 1055.35 | 0 |
| 1055.4 | 0 |
| 1055.45 | 0 |
| 1055.5 | 0 |
| 1055.55 | 0 |
| 1055.6 | 0 |
| 1055.65 | 0 |
| 1055.7 | 0 |
| 1055.75 | 0 |
| 1055.8 | 0 |
| 1055.85 | 0 |
| 1055.9 | 0 |
| 1055.95 | 0 |
| 1056.0 | 0 |
| 1056.05 | 0 |
| 1056.1 | 0 |
| 1056.15 | 0 |
| 1056.2 | 0 |
| 1056.25 | 0 |
| 1056.3 | 0 |
| 1056.35 | 0 |
| 1056.4 | 0 |
| 1056.45 | 0 |
| 1056.5 | 0 |
| 1056.55 | 0 |
| 1056.6 | 0 |
| 1056.65 | 0 |
| 1056.7 | 0 |
| 1056.75 | 0 |
| 1056.8 | 0 |
| 1056.85 | 0 |
| 1056.9 | 0 |
| 1056.95 | 0 |
| 1057.0 | 0 |
| 1057.05 | 0 |
| 1057.1 | 0 |
| 1057.15 | 0 |
| 1057.2 | 0 |
| 1057.25 | -0.001 |
| 1057.3 | -0.001 |
| 1057.35 | -0.001 |
| 1057.4 | -0.001 |
| 1057.45 | -0.001 |
| 1057.5 | -0.001 |
| 1057.55 | -0.001 |
| 1057.6 | -0.001 |
| 1057.65 | -0.001 |
| 1057.7 | -0.001 |
| 1057.75 | -0.001 |
| 1057.8 | -0.001 |
| 1057.85 | -0.001 |
| 1057.9 | -0.001 |
| 1057.95 | -0.001 |
| 1058.0 | -0.001 |
| 1058.05 | -0.001 |
| 1058.1 | -0.001 |
| 1058.15 | -0.001 |
| 1058.2 | -0.001 |
| 1058.25 | -0.001 |
| 1058.3 | -0.001 |
| 1058.35 | -0.001 |
| 1058.4 | -0.001 |
| 1058.45 | -0.001 |
| 1058.5 | -0.001 |
| 1058.55 | -0.001 |
| 1058.6 | -0.001 |
| 1058.65 | -0.001 |
| 1058.7 | -0.001 |
| 1058.75 | -0.001 |
| 1058.8 | -0.001 |
| 1058.85 | -0.001 |
| 1058.9 | -0.001 |
| 1058.95 | -0.001 |
| 1059.0 | -0.001 |
| 1059.05 | -0.001 |
| 1059.1 | -0.001 |
| 1059.15 | -0.001 |
| 1059.2 | -0.001 |
| 1059.25 | -0.001 |
| 1059.3 | -0.001 |
| 1059.35 | -0.001 |
| 1059.4 | -0.001 |
| 1059.45 | -0.001 |
| 1059.5 | -0.001 |
| 1059.55 | -0.001 |
| 1059.6 | -0.001 |
| 1059.65 | -0.001 |
| 1059.7 | -0.001 |
| 1059.75 | -0.001 |
| 1059.8 | -0.001 |
| 1059.85 | -0.001 |
| 1059.9 | -0.001 |
| 1059.95 | -0.001 |
| 1060.0 | -0.001 |
| 1060.05 | -0.001 |
| 1060.1 | -0.001 |
| 1060.15 | -0.001 |
| 1060.2 | -0.001 |
| 1060.25 | -0.001 |
| 1060.3 | -0.001 |
| 1060.35 | -0.001 |
| 1060.4 | -0.001 |
| 1060.45 | -0.001 |
| 1060.5 | -0.001 |
| 1060.55 | -0.001 |
| 1060.6 | -0.001 |
| 1060.65 | -0.001 |
| 1060.7 | -0.001 |
| 1060.75 | -0.001 |
| 1060.8 | -0.001 |
| 1060.85 | -0.001 |
| 1060.9 | -0.001 |
| 1060.95 | -0.001 |
| 1061.0 | -0.001 |
| 1061.05 | -0.001 |
| 1061.1 | -0.001 |
| 1061.15 | -0.001 |
| 1061.2 | -0.001 |
| 1061.25 | -0.001 |
| 1061.3 | -0.001 |
| 1061.35 | -0.001 |
| 1061.4 | -0.001 |
| 1061.45 | -0.001 |
| 1061.5 | -0.001 |
| 1061.55 | -0.001 |
| 1061.6 | -0.001 |
| 1061.65 | -0.001 |
| 1061.7 | -0.001 |
| 1061.75 | -0.001 |
| 1061.8 | -0.001 |
| 1061.85 | -0.001 |
| 1061.9 | -0.001 |
| 1061.95 | -0.001 |
| 1062.0 | -0.001 |
| 1062.05 | -0.001 |
| 1062.1 | -0.001 |
| 1062.15 | -0.001 |
| 1062.2 | -0.001 |
| 1062.25 | -0.001 |
| 1062.3 | -0.001 |
| 1062.35 | -0.001 |
| 1062.4 | -0.001 |
| 1062.45 | -0.001 |
| 1062.5 | -0.001 |
| 1062.55 | -0.001 |
| 1062.6 | -0.001 |
| 1062.65 | -0.001 |
| 1062.7 | -0.001 |
| 1062.75 | -0.001 |
| 1062.8 | -0.001 |
| 1062.85 | -0.001 |
| 1062.9 | -0.001 |
| 1062.95 | -0.001 |
| 1063.0 | -0.001 |
| 1063.05 | -0.001 |
| 1063.1 | -0.001 |
| 1063.15 | -0.001 |
| 1063.2 | -0.001 |
| 1063.25 | -0.001 |
| 1063.3 | -0.001 |
| 1063.35 | -0.001 |
| 1063.4 | -0.001 |
| 1063.45 | -0.001 |
| 1063.5 | -0.001 |
| 1063.55 | -0.001 |
| 1063.6 | -0.001 |
| 1063.65 | -0.001 |
| 1063.7 | -0.001 |
| 1063.75 | -0.001 |
| 1063.8 | -0.001 |
| 1063.85 | -0.001 |
| 1063.9 | -0.001 |
| 1063.95 | -0.001 |
| 1064.0 | -0.001 |
| 1064.05 | -0.001 |
| 1064.1 | -0.001 |
| 1064.15 | -0.001 |
| 1064.2 | -0.001 |
| 1064.25 | -0.001 |
| 1064.3 | -0.001 |
| 1064.35 | -0.001 |
| 1064.4 | -0.001 |
| 1064.45 | -0.001 |
| 1064.5 | -0.001 |
| 1064.55 | -0.001 |
| 1064.6 | -0.001 |
| 1064.65 | -0.001 |
| 1064.7 | -0.001 |
| 1064.75 | -0.001 |
| 1064.8 | -0.001 |
| 1064.85 | -0.001 |
| 1064.9 | -0.001 |
| 1064.95 | -0.001 |
| 1065.0 | -0.001 |
| 1065.05 | -0.001 |
| 1065.1 | -0.001 |
| 1065.15 | -0.001 |
| 1065.2 | -0.001 |
| 1065.25 | -0.001 |
| 1065.3 | -0.001 |
| 1065.35 | -0.001 |
| 1065.4 | -0.001 |
| 1065.45 | -0.001 |
| 1065.5 | -0.001 |
| 1065.55 | -0.001 |
| 1065.6 | -0.001 |
| 1065.65 | -0.001 |
| 1065.7 | -0.001 |
| 1065.75 | -0.001 |
| 1065.8 | -0.001 |
| 1065.85 | -0.001 |
| 1065.9 | -0.001 |
| 1065.95 | -0.001 |
| 1066.0 | -0.001 |
| 1066.05 | -0.001 |
| 1066.1 | -0.001 |
| 1066.15 | -0.001 |
| 1066.2 | -0.001 |
| 1066.25 | -0.001 |
| 1066.3 | -0.001 |
| 1066.35 | -0.001 |
| 1066.4 | -0.001 |
| 1066.45 | -0.001 |
| 1066.5 | -0.001 |
| 1066.55 | -0.001 |
| 1066.6 | -0.001 |
| 1066.65 | -0.001 |
| 1066.7 | -0.001 |
| 1066.75 | -0.001 |
| 1066.8 | -0.001 |
| 1066.85 | -0.001 |
| 1066.9 | -0.001 |
| 1066.95 | -0.001 |
| 1067.0 | -0.001 |
| 1067.05 | -0.001 |
| 1067.1 | -0.001 |
| 1067.15 | -0.001 |
| 1067.2 | -0.001 |
| 1067.25 | -0.001 |
| 1067.3 | -0.001 |
| 1067.35 | -0.001 |
| 1067.4 | -0.001 |
| 1067.45 | -0.001 |
| 1067.5 | -0.001 |
| 1067.55 | -0.001 |
| 1067.6 | -0.001 |
| 1067.65 | -0.001 |
| 1067.7 | -0.001 |
| 1067.75 | -0.001 |
| 1067.8 | -0.001 |
| 1067.85 | -0.001 |
| 1067.9 | -0.001 |
| 1067.95 | -0.001 |
| 1068.0 | -0.001 |
| 1068.05 | -0.001 |
| 1068.1 | -0.001 |
| 1068.15 | -0.001 |
| 1068.2 | -0.001 |
| 1068.25 | -0.001 |
| 1068.3 | -0.001 |
| 1068.35 | -0.001 |
| 1068.4 | -0.001 |
| 1068.45 | -0.001 |
| 1068.5 | -0.001 |
| 1068.55 | -0.001 |
| 1068.6 | -0.001 |
| 1068.65 | -0.001 |
| 1068.7 | -0.001 |
| 1068.75 | -0.001 |
| 1068.8 | -0.001 |
| 1068.85 | -0.001 |
| 1068.9 | -0.001 |
| 1068.95 | -0.001 |
| 1069.0 | -0.001 |
| 1069.05 | -0.001 |
| 1069.1 | -0.001 |
| 1069.15 | -0.001 |
| 1069.2 | -0.001 |
| 1069.25 | -0.001 |
| 1069.3 | -0.001 |
| 1069.35 | -0.001 |
| 1069.4 | -0.001 |
| 1069.45 | -0.001 |
| 1069.5 | -0.001 |
| 1069.55 | -0.001 |
| 1069.6 | -0.001 |
| 1069.65 | -0.001 |
| 1069.7 | -0.001 |
| 1069.75 | -0.001 |
| 1069.8 | -0.001 |
| 1069.85 | -0.001 |
| 1069.9 | -0.001 |
| 1069.95 | -0.001 |
| 1070.0 | -0.001 |
| 1070.05 | -0.001 |
| 1070.1 | -0.001 |
| 1070.15 | -0.001 |
| 1070.2 | -0.001 |
| 1070.25 | -0.001 |
| 1070.3 | -0.001 |
| 1070.35 | -0.001 |
| 1070.4 | -0.001 |
| 1070.45 | -0.001 |
| 1070.5 | -0.001 |
| 1070.55 | -0.001 |
| 1070.6 | -0.001 |
| 1070.65 | -0.001 |
| 1070.7 | -0.001 |
| 1070.75 | -0.001 |
| 1070.8 | -0.001 |
| 1070.85 | -0.001 |
| 1070.9 | -0.001 |
| 1070.95 | -0.001 |
| 1071.0 | -0.001 |
| 1071.05 | -0.001 |
| 1071.1 | -0.001 |
| 1071.15 | -0.001 |
| 1071.2 | -0.001 |
| 1071.25 | -0.001 |
| 1071.3 | -0.001 |
| 1071.35 | -0.001 |
| 1071.4 | -0.001 |
| 1071.45 | -0.001 |
| 1071.5 | -0.001 |
| 1071.55 | -0.001 |
| 1071.6 | -0.001 |
| 1071.65 | -0.001 |
| 1071.7 | -0.001 |
| 1071.75 | -0.001 |
| 1071.8 | -0.001 |
| 1071.85 | -0.001 |
| 1071.9 | -0.001 |
| 1071.95 | -0.001 |
| 1072.0 | -0.001 |
| 1072.05 | -0.001 |
| 1072.1 | -0.001 |
| 1072.15 | -0.001 |
| 1072.2 | -0.001 |
| 1072.25 | -0.001 |
| 1072.3 | -0.001 |
| 1072.35 | -0.001 |
| 1072.4 | -0.001 |
| 1072.45 | -0.001 |
| 1072.5 | -0.001 |
| 1072.55 | -0.001 |
| 1072.6 | -0.001 |
| 1072.65 | -0.001 |
| 1072.7 | -0.001 |
| 1072.75 | -0.001 |
| 1072.8 | -0.001 |
| 1072.85 | -0.001 |
| 1072.9 | -0.001 |
| 1072.95 | -0.001 |
| 1073.0 | -0.001 |
| 1073.05 | -0.001 |
| 1073.1 | -0.001 |
| 1073.15 | -0.001 |
| 1073.2 | -0.001 |
| 1073.25 | -0.001 |
| 1073.3 | -0.001 |
| 1073.35 | -0.001 |
| 1073.4 | -0.001 |
| 1073.45 | -0.001 |
| 1073.5 | -0.001 |
| 1073.55 | -0.001 |
| 1073.6 | -0.001 |
| 1073.65 | -0.001 |
| 1073.7 | -0.001 |
| 1073.75 | -0.001 |
| 1073.8 | -0.001 |
| 1073.85 | -0.001 |
| 1073.9 | -0.001 |
| 1073.95 | -0.001 |
| 1074.0 | -0.001 |
| 1074.05 | -0.001 |
| 1074.1 | -0.001 |
| 1074.15 | -0.001 |
| 1074.2 | -0.001 |
| 1074.25 | -0.001 |
| 1074.3 | -0.001 |
| 1074.35 | -0.001 |
| 1074.4 | -0.001 |
| 1074.45 | -0.001 |
| 1074.5 | -0.001 |
| 1074.55 | -0.001 |
| 1074.6 | -0.001 |
| 1074.65 | -0.001 |
| 1074.7 | -0.001 |
| 1074.75 | -0.001 |
| 1074.8 | -0.001 |
| 1074.85 | -0.001 |
| 1074.9 | -0.001 |
| 1074.95 | -0.001 |
| 1075.0 | -0.001 |
| 1075.05 | -0.001 |
| 1075.1 | -0.001 |
| 1075.15 | -0.001 |
| 1075.2 | -0.001 |
| 1075.25 | -0.001 |
| 1075.3 | -0.001 |
| 1075.35 | -0.001 |
| 1075.4 | -0.001 |
| 1075.45 | -0.001 |
| 1075.5 | -0.001 |
| 1075.55 | -0.001 |
| 1075.6 | -0.001 |
| 1075.65 | -0.001 |
| 1075.7 | -0.001 |
| 1075.75 | -0.001 |
| 1075.8 | -0.001 |
| 1075.85 | -0.001 |
| 1075.9 | -0.001 |
| 1075.95 | -0.001 |
| 1076.0 | -0.001 |
| 1076.05 | -0.001 |
| 1076.1 | -0.001 |
| 1076.15 | -0.001 |
| 1076.2 | -0.001 |
| 1076.25 | -0.001 |
| 1076.3 | -0.001 |
| 1076.35 | -0.001 |
| 1076.4 | -0.001 |
| 1076.45 | -0.001 |
| 1076.5 | -0.001 |
| 1076.55 | -0.001 |
| 1076.6 | -0.001 |
| 1076.65 | -0.001 |
| 1076.7 | -0.001 |
| 1076.75 | -0.001 |
| 1076.8 | -0.001 |
| 1076.85 | -0.001 |
| 1076.9 | -0.001 |
| 1076.95 | -0.001 |
| 1077.0 | -0.001 |
| 1077.05 | -0.001 |
| 1077.1 | -0.001 |
| 1077.15 | -0.001 |
| 1077.2 | -0.001 |
| 1077.25 | -0.001 |
| 1077.3 | -0.001 |
| 1077.35 | -0.001 |
| 1077.4 | -0.001 |
| 1077.45 | -0.001 |
| 1077.5 | -0.001 |
| 1077.55 | -0.001 |
| 1077.6 | -0.001 |
| 1077.65 | -0.001 |
| 1077.7 | -0.001 |
| 1077.75 | -0.001 |
| 1077.8 | -0.001 |
| 1077.85 | -0.001 |
| 1077.9 | -0.001 |
| 1077.95 | -0.001 |
| 1078.0 | -0.001 |
| 1078.05 | -0.001 |
| 1078.1 | -0.001 |
| 1078.15 | -0.001 |
| 1078.2 | -0.001 |
| 1078.25 | -0.001 |
| 1078.3 | -0.001 |
| 1078.35 | -0.001 |
| 1078.4 | -0.001 |
| 1078.45 | -0.001 |
| 1078.5 | -0.001 |
| 1078.55 | -0.001 |
| 1078.6 | -0.001 |
| 1078.65 | -0.001 |
| 1078.7 | -0.001 |
| 1078.75 | -0.001 |
| 1078.8 | -0.001 |
| 1078.85 | -0.001 |
| 1078.9 | -0.001 |
| 1078.95 | -0.001 |
| 1079.0 | -0.001 |
| 1079.05 | -0.001 |
| 1079.1 | -0.001 |
| 1079.15 | -0.001 |
| 1079.2 | -0.001 |
| 1079.25 | -0.001 |
| 1079.3 | -0.001 |
| 1079.35 | -0.001 |
| 1079.4 | -0.001 |
| 1079.45 | -0.001 |
| 1079.5 | -0.001 |
| 1079.55 | -0.001 |
| 1079.6 | -0.001 |
| 1079.65 | -0.001 |
| 1079.7 | -0.001 |
| 1079.75 | -0.001 |
| 1079.8 | -0.001 |
| 1079.85 | -0.001 |
| 1079.9 | -0.001 |
| 1079.95 | -0.001 |
| 1080.0 | -0.001 |
| 1080.05 | -0.001 |
| 1080.1 | -0.001 |
| 1080.15 | -0.001 |
| 1080.2 | -0.001 |
| 1080.25 | -0.001 |
| 1080.3 | -0.001 |
| 1080.35 | -0.001 |
| 1080.4 | -0.001 |
| 1080.45 | -0.001 |
| 1080.5 | -0.001 |
| 1080.55 | -0.001 |
| 1080.6 | -0.001 |
| 1080.65 | -0.001 |
| 1080.7 | -0.001 |
| 1080.75 | -0.001 |
| 1080.8 | -0.001 |
| 1080.85 | -0.001 |
| 1080.9 | -0.001 |
| 1080.95 | -0.001 |
| 1081.0 | -0.001 |
| 1081.05 | -0.001 |
| 1081.1 | -0.001 |
| 1081.15 | -0.001 |
| 1081.2 | -0.001 |
| 1081.25 | -0.001 |
| 1081.3 | -0.001 |
| 1081.35 | -0.001 |
| 1081.4 | -0.001 |
| 1081.45 | -0.001 |
| 1081.5 | -0.001 |
| 1081.55 | -0.001 |
| 1081.6 | -0.001 |
| 1081.65 | -0.001 |
| 1081.7 | -0.001 |
| 1081.75 | -0.001 |
| 1081.8 | -0.001 |
| 1081.85 | -0.001 |
| 1081.9 | -0.001 |
| 1081.95 | -0.001 |
| 1082.0 | -0.001 |
| 1082.05 | -0.001 |
| 1082.1 | -0.001 |
| 1082.15 | -0.001 |
| 1082.2 | -0.001 |
| 1082.25 | -0.001 |
| 1082.3 | -0.001 |
| 1082.35 | -0.001 |
| 1082.4 | -0.001 |
| 1082.45 | -0.001 |
| 1082.5 | -0.001 |
| 1082.55 | -0.001 |
| 1082.6 | -0.001 |
| 1082.65 | -0.001 |
| 1082.7 | -0.001 |
| 1082.75 | -0.001 |
| 1082.8 | -0.001 |
| 1082.85 | -0.001 |
| 1082.9 | -0.001 |
| 1082.95 | -0.001 |
| 1083.0 | -0.001 |
| 1083.05 | -0.001 |
| 1083.1 | -0.001 |
| 1083.15 | -0.001 |
| 1083.2 | -0.001 |
| 1083.25 | -0.001 |
| 1083.3 | -0.001 |
| 1083.35 | -0.001 |
| 1083.4 | -0.001 |
| 1083.45 | -0.001 |
| 1083.5 | -0.001 |
| 1083.55 | -0.001 |
| 1083.6 | -0.001 |
| 1083.65 | -0.001 |
| 1083.7 | -0.001 |
| 1083.75 | -0.001 |
| 1083.8 | -0.001 |
| 1083.85 | -0.001 |
| 1083.9 | -0.001 |
| 1083.95 | -0.001 |
| 1084.0 | -0.001 |
| 1084.05 | -0.001 |
| 1084.1 | -0.001 |
| 1084.15 | -0.001 |
| 1084.2 | -0.001 |
| 1084.25 | -0.001 |
| 1084.3 | -0.001 |
| 1084.35 | -0.001 |
| 1084.4 | -0.001 |
| 1084.45 | -0.001 |
| 1084.5 | -0.001 |
| 1084.55 | -0.001 |
| 1084.6 | -0.001 |
| 1084.65 | -0.001 |
| 1084.7 | -0.001 |
| 1084.75 | -0.001 |
| 1084.8 | -0.001 |
| 1084.85 | -0.001 |
| 1084.9 | -0.001 |
| 1084.95 | -0.001 |
| 1085.0 | -0.001 |
| 1085.05 | -0.001 |
| 1085.1 | -0.001 |
| 1085.15 | -0.001 |
| 1085.2 | -0.001 |
| 1085.25 | -0.001 |
| 1085.3 | -0.001 |
| 1085.35 | -0.001 |
| 1085.4 | -0.001 |
| 1085.45 | -0.001 |
| 1085.5 | -0.001 |
| 1085.55 | -0.001 |
| 1085.6 | -0.001 |
| 1085.65 | -0.001 |
| 1085.7 | -0.001 |
| 1085.75 | -0.001 |
| 1085.8 | -0.001 |
| 1085.85 | -0.001 |
| 1085.9 | -0.001 |
| 1085.95 | -0.001 |
| 1086.0 | -0.001 |
| 1086.05 | -0.001 |
| 1086.1 | -0.001 |
| 1086.15 | -0.001 |
| 1086.2 | -0.001 |
| 1086.25 | -0.001 |
| 1086.3 | -0.001 |
| 1086.35 | -0.001 |
| 1086.4 | -0.001 |
| 1086.45 | -0.001 |
| 1086.5 | -0.001 |
| 1086.55 | -0.001 |
| 1086.6 | -0.001 |
| 1086.65 | -0.001 |
| 1086.7 | -0.001 |
| 1086.75 | -0.001 |
| 1086.8 | -0.001 |
| 1086.85 | -0.001 |
| 1086.9 | -0.001 |
| 1086.95 | -0.001 |
| 1087.0 | -0.001 |
| 1087.05 | -0.001 |
| 1087.1 | -0.001 |
| 1087.15 | -0.001 |
| 1087.2 | -0.001 |
| 1087.25 | -0.001 |
| 1087.3 | -0.001 |
| 1087.35 | -0.001 |
| 1087.4 | -0.001 |
| 1087.45 | -0.001 |
| 1087.5 | -0.001 |
| 1087.55 | -0.001 |
| 1087.6 | -0.001 |
| 1087.65 | -0.001 |
| 1087.7 | -0.001 |
| 1087.75 | -0.001 |
| 1087.8 | -0.001 |
| 1087.85 | -0.001 |
| 1087.9 | -0.001 |
| 1087.95 | -0.001 |
| 1088.0 | -0.001 |
| 1088.05 | -0.001 |
| 1088.1 | -0.001 |
| 1088.15 | -0.001 |
| 1088.2 | -0.001 |
| 1088.25 | -0.001 |
| 1088.3 | -0.001 |
| 1088.35 | -0.001 |
| 1088.4 | -0.001 |
| 1088.45 | -0.001 |
| 1088.5 | -0.001 |
| 1088.55 | -0.001 |
| 1088.6 | -0.001 |
| 1088.65 | -0.001 |
| 1088.7 | -0.001 |
| 1088.75 | -0.001 |
| 1088.8 | -0.001 |
| 1088.85 | -0.001 |
| 1088.9 | -0.001 |
| 1088.95 | -0.001 |
| 1089.0 | -0.001 |
| 1089.05 | -0.001 |
| 1089.1 | -0.001 |
| 1089.15 | -0.001 |
| 1089.2 | -0.001 |
| 1089.25 | -0.001 |
| 1089.3 | -0.001 |
| 1089.35 | -0.001 |
| 1089.4 | -0.001 |
| 1089.45 | -0.001 |
| 1089.5 | -0.001 |
| 1089.55 | -0.001 |
| 1089.6 | -0.001 |
| 1089.65 | -0.001 |
| 1089.7 | -0.001 |
| 1089.75 | -0.001 |
| 1089.8 | -0.001 |
| 1089.85 | -0.001 |
| 1089.9 | -0.001 |
| 1089.95 | -0.001 |
| 1090.0 | -0.001 |
| 1090.05 | -0.001 |
| 1090.1 | -0.001 |
| 1090.15 | -0.001 |
| 1090.2 | -0.001 |
| 1090.25 | -0.001 |
| 1090.3 | -0.001 |
| 1090.35 | -0.001 |
| 1090.4 | -0.001 |
| 1090.45 | -0.001 |
| 1090.5 | -0.001 |
| 1090.55 | -0.001 |
| 1090.6 | -0.001 |
| 1090.65 | 0 |
| 1090.7 | 0 |
| 1090.75 | 0 |
| 1090.8 | 0 |
| 1090.85 | 0 |
| 1090.9 | 0 |
| 1090.95 | 0 |
| 1091.0 | 0 |
| 1091.05 | 0 |
| 1091.1 | 0 |
| 1091.15 | 0 |
| 1091.2 | 0 |
| 1091.25 | 0 |
| 1091.3 | 0 |
| 1091.35 | 0 |
| 1091.4 | 0 |
| 1091.45 | 0 |
| 1091.5 | 0 |
| 1091.55 | 0 |
| 1091.6 | 0 |
| 1091.65 | 0 |
| 1091.7 | -0.001 |
| 1091.75 | -0.001 |
| 1091.8 | -0.001 |
| 1091.85 | -0.001 |
| 1091.9 | -0.001 |
| 1091.95 | -0.001 |
| 1092.0 | -0.001 |
| 1092.05 | -0.001 |
| 1092.1 | -0.001 |
| 1092.15 | -0.001 |
| 1092.2 | -0.001 |
| 1092.25 | 0 |
| 1092.3 | 0 |
| 1092.35 | 0 |
| 1092.4 | 0 |
| 1092.45 | 0 |
| 1092.5 | 0 |
| 1092.55 | 0 |
| 1092.6 | 0 |
| 1092.65 | 0 |
| 1092.7 | 0 |
| 1092.75 | 0 |
| 1092.8 | 0 |
| 1092.85 | 0 |
| 1092.9 | 0 |
| 1092.95 | 0 |
| 1093.0 | 0 |
| 1093.05 | 0 |
| 1093.1 | 0 |
| 1093.15 | 0 |
| 1093.2 | 0 |
| 1093.25 | 0 |
| 1093.3 | 0 |
| 1093.35 | 0 |
| 1093.4 | 0 |
| 1093.45 | 0 |
| 1093.5 | 0 |
| 1093.55 | 0 |
| 1093.6 | 0 |
| 1093.65 | 0 |
| 1093.7 | 0 |
| 1093.75 | 0 |
| 1093.8 | 0 |
| 1093.85 | 0 |
| 1093.9 | 0 |
| 1093.95 | 0 |
| 1094.0 | 0 |
| 1094.05 | 0 |
| 1094.1 | 0 |
| 1094.15 | 0 |
| 1094.2 | 0 |
| 1094.25 | 0 |
| 1094.3 | 0 |
| 1094.35 | 0 |
| 1094.4 | 0 |
| 1094.45 | 0 |
| 1094.5 | 0 |
| 1094.55 | 0 |
| 1094.6 | 0 |
| 1094.65 | 0 |
| 1094.7 | 0 |
| 1094.75 | 0 |
| 1094.8 | 0 |
| 1094.85 | 0 |
| 1094.9 | 0 |
| 1094.95 | 0 |
| 1095.0 | 0 |
| 1095.05 | 0 |
| 1095.1 | 0 |
| 1095.15 | 0 |
| 1095.2 | 0 |
| 1095.25 | 0 |
| 1095.3 | 0 |
| 1095.35 | 0 |
| 1095.4 | 0 |
| 1095.45 | 0 |
| 1095.5 | 0 |
| 1095.55 | 0 |
| 1095.6 | 0 |
| 1095.65 | 0 |
| 1095.7 | 0 |
| 1095.75 | 0 |
| 1095.8 | 0 |
| 1095.85 | 0 |
| 1095.9 | 0 |
| 1095.95 | 0 |
| 1096.0 | 0 |
| 1096.05 | 0 |
| 1096.1 | 0 |
| 1096.15 | 0 |
| 1096.2 | 0 |
| 1096.25 | 0 |
| 1096.3 | 0 |
| 1096.35 | 0 |
| 1096.4 | 0 |
| 1096.45 | 0 |
| 1096.5 | 0 |
| 1096.55 | 0 |
| 1096.6 | 0 |
| 1096.65 | 0 |
| 1096.7 | 0 |
| 1096.75 | 0 |
| 1096.8 | 0 |
| 1096.85 | 0 |
| 1096.9 | 0 |
| 1096.95 | 0 |
| 1097.0 | 0 |
| 1097.05 | 0 |
| 1097.1 | 0 |
| 1097.15 | 0 |
| 1097.2 | 0 |
| 1097.25 | 0 |
| 1097.3 | 0 |
| 1097.35 | 0 |
| 1097.4 | 0 |
| 1097.45 | 0 |
| 1097.5 | 0 |
| 1097.55 | 0 |
| 1097.6 | 0 |
| 1097.65 | 0 |
| 1097.7 | 0 |
| 1097.75 | 0 |
| 1097.8 | 0 |
| 1097.85 | 0 |
| 1097.9 | 0 |
| 1097.95 | 0 |
| 1098.0 | 0 |
| 1098.05 | 0 |
| 1098.1 | 0 |
| 1098.15 | 0 |
| 1098.2 | 0 |
| 1098.25 | 0 |
| 1098.3 | 0 |
| 1098.35 | 0 |
| 1098.4 | 0 |
| 1098.45 | 0 |
| 1098.5 | 0 |
| 1098.55 | 0 |
| 1098.6 | 0 |
| 1098.65 | 0 |
| 1098.7 | 0 |
| 1098.75 | 0 |
| 1098.8 | 0 |
| 1098.85 | 0 |
| 1098.9 | 0 |
| 1098.95 | 0 |
| 1099.0 | 0 |
| 1099.05 | 0 |
| 1099.1 | 0 |
| 1099.15 | 0 |
| 1099.2 | 0 |
| 1099.25 | 0 |
| 1099.3 | 0 |
| 1099.35 | 0 |
| 1099.4 | 0 |
| 1099.45 | 0 |
| 1099.5 | 0 |
| 1099.55 | 0 |
| 1099.6 | 0 |
| 1099.65 | 0 |
| 1099.7 | 0 |
| 1099.75 | 0 |
| 1099.8 | 0 |
| 1099.85 | 0 |
| 1099.9 | 0 |
| 1099.95 | 0 |
| 1100.0 | 0 |